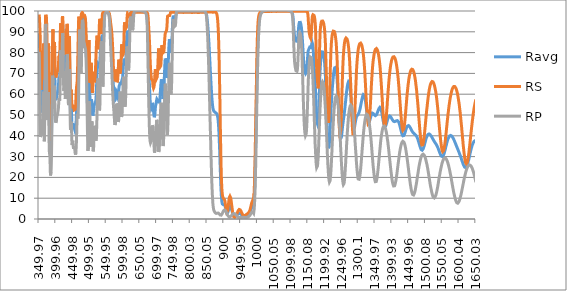
| Category | Ravg | RS | RP |
|---|---|---|---|
| 349.97 | 89.314 | 98.315 | 80.313 |
| 350.48 | 88.266 | 97.754 | 78.778 |
| 350.99 | 86.706 | 96.834 | 76.578 |
| 351.5 | 83.385 | 94.822 | 71.948 |
| 352.01 | 78.381 | 93.184 | 63.578 |
| 352.52 | 72.167 | 91.414 | 52.921 |
| 353.02 | 67.136 | 89.264 | 45.009 |
| 353.53 | 63.047 | 85.7 | 40.395 |
| 354.03 | 59.229 | 79.021 | 39.438 |
| 354.53 | 55.199 | 71.357 | 39.041 |
| 355.03 | 52.325 | 65.223 | 39.428 |
| 355.53 | 51.27 | 62.111 | 40.428 |
| 356.03 | 51.622 | 62.345 | 40.899 |
| 356.52 | 52.393 | 63.648 | 41.139 |
| 357.01 | 52.823 | 65.028 | 40.619 |
| 357.51 | 53.643 | 66.479 | 40.808 |
| 358.0 | 54.487 | 66.963 | 42.01 |
| 358.49 | 54.809 | 66.506 | 43.111 |
| 358.97 | 55.032 | 66.554 | 43.51 |
| 359.46 | 55.411 | 67.169 | 43.652 |
| 360.06 | 56.532 | 67.495 | 45.568 |
| 360.55 | 58.156 | 68.597 | 47.714 |
| 361.03 | 60.345 | 71.224 | 49.466 |
| 361.5 | 62.787 | 73.882 | 51.692 |
| 361.98 | 65.631 | 76.795 | 54.467 |
| 362.46 | 68.462 | 78.992 | 57.932 |
| 363.05 | 71.4 | 81.593 | 61.208 |
| 363.52 | 72.122 | 84.338 | 59.906 |
| 363.98 | 70.126 | 84.331 | 55.92 |
| 364.45 | 65.48 | 82.031 | 48.929 |
| 365.03 | 58.655 | 75.91 | 41.4 |
| 365.49 | 54.22 | 71.079 | 37.361 |
| 365.95 | 52.893 | 67.464 | 38.322 |
| 366.53 | 56.178 | 67.527 | 44.829 |
| 366.98 | 61.966 | 70.744 | 53.188 |
| 367.55 | 71.764 | 78.322 | 65.206 |
| 368.0 | 80.056 | 84.503 | 75.609 |
| 368.45 | 87.608 | 91.346 | 83.87 |
| 369.01 | 93.39 | 96.186 | 90.594 |
| 369.46 | 95.363 | 97.665 | 93.06 |
| 370.01 | 95.983 | 98.174 | 93.791 |
| 370.45 | 95.386 | 98.452 | 92.32 |
| 371.0 | 92.914 | 97.579 | 88.249 |
| 371.55 | 90.086 | 97.618 | 82.554 |
| 371.98 | 86.357 | 96.905 | 75.809 |
| 372.52 | 80.644 | 94.08 | 67.208 |
| 372.95 | 75.912 | 91.599 | 60.226 |
| 373.49 | 69.251 | 85.722 | 52.779 |
| 374.02 | 64.599 | 80.776 | 48.421 |
| 374.45 | 61.809 | 76.016 | 47.601 |
| 374.98 | 60.613 | 71.563 | 49.663 |
| 375.51 | 60.574 | 68.768 | 52.379 |
| 376.03 | 62.253 | 69.52 | 54.986 |
| 376.45 | 64.669 | 71.954 | 57.384 |
| 376.97 | 67.995 | 76.303 | 59.686 |
| 377.49 | 70.843 | 80.647 | 61.039 |
| 378.01 | 71.708 | 84.347 | 59.069 |
| 378.52 | 69.463 | 84.784 | 54.142 |
| 379.04 | 64.197 | 81.47 | 46.924 |
| 379.55 | 57.413 | 74.988 | 39.839 |
| 379.96 | 52.544 | 69.575 | 35.514 |
| 380.47 | 48.177 | 63.856 | 32.498 |
| 380.97 | 45.99 | 60.562 | 31.418 |
| 381.48 | 45.778 | 59.908 | 31.648 |
| 381.98 | 45.634 | 60.539 | 30.73 |
| 382.49 | 43.755 | 58.847 | 28.662 |
| 382.99 | 39.909 | 54.189 | 25.63 |
| 383.49 | 35.344 | 48.081 | 22.607 |
| 383.99 | 31.757 | 42.596 | 20.918 |
| 384.49 | 29.785 | 39.051 | 20.519 |
| 384.99 | 29.42 | 37.467 | 21.373 |
| 385.49 | 30.683 | 38.769 | 22.597 |
| 385.99 | 32.845 | 41.473 | 24.217 |
| 386.49 | 36.17 | 45.165 | 27.176 |
| 386.99 | 40.264 | 49.234 | 31.295 |
| 387.49 | 45.447 | 54.165 | 36.728 |
| 387.99 | 51.605 | 59.669 | 43.542 |
| 388.48 | 58.417 | 66.312 | 50.523 |
| 388.98 | 64.849 | 72.699 | 56.999 |
| 389.48 | 70.915 | 79.124 | 62.706 |
| 389.98 | 75.418 | 84.211 | 66.626 |
| 390.49 | 78.774 | 88.638 | 68.909 |
| 390.99 | 79.897 | 91.177 | 68.617 |
| 391.49 | 78.362 | 91.309 | 65.414 |
| 392.0 | 75.107 | 89.286 | 60.929 |
| 392.5 | 71.045 | 85.794 | 56.296 |
| 393.01 | 67.892 | 82.343 | 53.441 |
| 393.51 | 66.609 | 80.313 | 52.905 |
| 394.02 | 67.277 | 79.649 | 54.905 |
| 394.54 | 69.641 | 80.713 | 58.57 |
| 395.05 | 72.854 | 83.354 | 62.355 |
| 395.46 | 74.505 | 84.965 | 64.046 |
| 395.97 | 74.325 | 85.191 | 63.46 |
| 396.49 | 71.353 | 82.622 | 60.084 |
| 397.01 | 66.867 | 78.131 | 55.603 |
| 397.53 | 62.957 | 73.967 | 51.947 |
| 397.95 | 60.654 | 71.781 | 49.527 |
| 398.48 | 58.783 | 69.771 | 47.795 |
| 399.01 | 57.829 | 68.826 | 46.832 |
| 399.54 | 57.201 | 68.089 | 46.313 |
| 399.96 | 56.964 | 67.761 | 46.168 |
| 400.5 | 56.823 | 67.734 | 45.913 |
| 401.04 | 57.465 | 68.401 | 46.529 |
| 401.47 | 58.164 | 69.099 | 47.228 |
| 402.01 | 58.998 | 69.914 | 48.082 |
| 402.45 | 59.69 | 70.411 | 48.968 |
| 402.99 | 60.126 | 70.784 | 49.468 |
| 403.54 | 60.324 | 70.815 | 49.833 |
| 403.99 | 60.23 | 70.677 | 49.782 |
| 404.54 | 60.313 | 70.665 | 49.961 |
| 404.99 | 60.516 | 70.799 | 50.234 |
| 405.55 | 60.946 | 71.106 | 50.787 |
| 406.0 | 61.436 | 71.443 | 51.429 |
| 406.45 | 61.938 | 71.939 | 51.936 |
| 407.02 | 62.773 | 72.958 | 52.589 |
| 407.48 | 63.657 | 73.99 | 53.325 |
| 408.05 | 65.048 | 75.543 | 54.554 |
| 408.51 | 66.341 | 76.866 | 55.816 |
| 408.97 | 67.436 | 77.906 | 56.966 |
| 409.55 | 68.266 | 78.468 | 58.065 |
| 410.02 | 68.038 | 78.082 | 57.994 |
| 410.49 | 67.517 | 77.657 | 57.378 |
| 410.96 | 67.379 | 77.935 | 56.823 |
| 411.55 | 68.536 | 79.511 | 57.562 |
| 412.03 | 70.612 | 81.463 | 59.76 |
| 412.5 | 73.819 | 84.55 | 63.088 |
| 412.98 | 77.757 | 88.082 | 67.431 |
| 413.46 | 82.104 | 91.793 | 72.416 |
| 413.94 | 85.724 | 94.071 | 77.377 |
| 414.55 | 87.542 | 93.941 | 81.142 |
| 415.04 | 86.192 | 91.597 | 80.787 |
| 415.52 | 83.047 | 88.68 | 77.415 |
| 416.01 | 80.033 | 87.172 | 72.894 |
| 416.5 | 77.834 | 86.419 | 69.249 |
| 417.0 | 77.142 | 86.217 | 68.067 |
| 417.49 | 78.219 | 87.503 | 68.934 |
| 417.99 | 80.674 | 89.987 | 71.36 |
| 418.48 | 84.571 | 93.185 | 75.957 |
| 418.98 | 88.803 | 96.053 | 81.553 |
| 419.48 | 92.063 | 97.466 | 86.659 |
| 419.98 | 93.516 | 97.58 | 89.453 |
| 420.49 | 93.167 | 96.797 | 89.537 |
| 420.99 | 90.765 | 94.604 | 86.927 |
| 421.5 | 86.363 | 91.136 | 81.589 |
| 422.0 | 81.108 | 87.275 | 74.942 |
| 422.51 | 76.664 | 84.701 | 68.626 |
| 423.02 | 73.896 | 83.34 | 64.451 |
| 423.53 | 72.433 | 82.768 | 62.098 |
| 424.04 | 72.344 | 83.143 | 61.546 |
| 424.55 | 74.072 | 85.16 | 62.984 |
| 425.06 | 76.251 | 87.093 | 65.408 |
| 425.45 | 77.284 | 87.702 | 66.865 |
| 425.96 | 76.814 | 86.561 | 67.068 |
| 426.48 | 74.462 | 83.808 | 65.116 |
| 426.99 | 71.808 | 81.49 | 62.126 |
| 427.51 | 69.561 | 79.628 | 59.494 |
| 428.03 | 68.308 | 78.903 | 57.712 |
| 428.54 | 68.425 | 79.278 | 57.571 |
| 429.06 | 69.982 | 81.183 | 58.782 |
| 429.45 | 71.84 | 83.172 | 60.508 |
| 429.97 | 74.519 | 85.833 | 63.205 |
| 430.49 | 76.95 | 88.024 | 65.876 |
| 431.01 | 78.777 | 89.28 | 68.274 |
| 431.52 | 80.42 | 90.499 | 70.34 |
| 432.04 | 82.035 | 91.587 | 72.483 |
| 432.56 | 83.617 | 92.573 | 74.661 |
| 432.95 | 84.794 | 93.279 | 76.308 |
| 433.47 | 86.073 | 93.816 | 78.329 |
| 433.99 | 86.504 | 93.696 | 79.312 |
| 434.51 | 85.438 | 92.168 | 78.709 |
| 435.03 | 82.062 | 88.405 | 75.719 |
| 435.55 | 76.715 | 83.113 | 70.316 |
| 435.94 | 72.423 | 79.254 | 65.592 |
| 436.46 | 67.662 | 75.401 | 59.924 |
| 436.97 | 64.699 | 73.307 | 56.091 |
| 437.49 | 63.768 | 72.793 | 54.744 |
| 438.01 | 65.083 | 74.325 | 55.841 |
| 438.52 | 68.847 | 78.27 | 59.425 |
| 439.04 | 74.015 | 83.23 | 64.8 |
| 439.55 | 78.374 | 86.993 | 69.755 |
| 439.94 | 79.997 | 87.907 | 72.087 |
| 440.45 | 79.335 | 86.452 | 72.218 |
| 440.96 | 75.539 | 82.429 | 68.649 |
| 441.48 | 69.63 | 76.662 | 62.599 |
| 441.99 | 63.024 | 70.383 | 55.664 |
| 442.5 | 57.397 | 65.135 | 49.659 |
| 443.0 | 53.237 | 61.345 | 45.129 |
| 443.51 | 50.91 | 59.048 | 42.772 |
| 444.02 | 50.659 | 58.738 | 42.58 |
| 444.52 | 51.962 | 59.951 | 43.973 |
| 445.03 | 53.72 | 61.6 | 45.84 |
| 445.53 | 54.458 | 62.16 | 46.756 |
| 446.03 | 53.497 | 61.152 | 45.842 |
| 446.53 | 51.19 | 58.988 | 43.391 |
| 447.03 | 48.474 | 56.476 | 40.471 |
| 447.52 | 46.101 | 54.46 | 37.743 |
| 448.02 | 44.7 | 53.274 | 36.126 |
| 448.51 | 44.218 | 52.898 | 35.538 |
| 449.0 | 44.529 | 53.15 | 35.908 |
| 449.49 | 45.351 | 53.821 | 36.88 |
| 449.98 | 46.004 | 54.4 | 37.608 |
| 450.47 | 46.171 | 54.636 | 37.707 |
| 450.96 | 45.818 | 54.598 | 37.038 |
| 451.56 | 44.966 | 54.299 | 35.633 |
| 452.04 | 44.191 | 53.933 | 34.449 |
| 452.52 | 43.677 | 53.618 | 33.736 |
| 453.0 | 43.448 | 53.389 | 33.507 |
| 453.48 | 43.422 | 53.079 | 33.766 |
| 453.95 | 43.602 | 52.787 | 34.416 |
| 454.54 | 43.7 | 52.41 | 34.991 |
| 455.01 | 43.676 | 52.166 | 35.185 |
| 455.48 | 43.466 | 52.05 | 34.883 |
| 456.06 | 43.023 | 52.116 | 33.93 |
| 456.52 | 42.634 | 52.284 | 32.985 |
| 456.99 | 42.338 | 52.563 | 32.113 |
| 457.45 | 42.093 | 52.709 | 31.478 |
| 458.02 | 42.174 | 53.348 | 31 |
| 458.47 | 42.583 | 54.194 | 30.972 |
| 459.04 | 43.44 | 55.674 | 31.205 |
| 459.49 | 44.549 | 57.292 | 31.806 |
| 460.05 | 46.194 | 59.291 | 33.097 |
| 460.5 | 47.785 | 60.975 | 34.596 |
| 460.95 | 49.4 | 62.264 | 36.536 |
| 461.5 | 51.493 | 63.533 | 39.453 |
| 462.05 | 53.352 | 64.125 | 42.578 |
| 462.49 | 54.745 | 64.32 | 45.17 |
| 463.04 | 56.654 | 65.296 | 48.011 |
| 463.47 | 58.189 | 66.705 | 49.673 |
| 464.01 | 59.951 | 69.364 | 50.537 |
| 464.55 | 61.109 | 72.171 | 50.046 |
| 464.98 | 61.987 | 74.943 | 49.032 |
| 465.51 | 63.626 | 78.925 | 48.326 |
| 466.04 | 66.303 | 83.749 | 48.857 |
| 466.47 | 69.065 | 87.538 | 50.591 |
| 466.99 | 73.095 | 91.985 | 54.204 |
| 467.52 | 77.118 | 94.966 | 59.269 |
| 468.04 | 81.097 | 96.634 | 65.56 |
| 468.46 | 84.304 | 97.279 | 71.329 |
| 468.97 | 87.964 | 97.668 | 78.261 |
| 469.49 | 90.813 | 97.618 | 84.009 |
| 470.0 | 92.351 | 96.854 | 87.849 |
| 470.52 | 92.586 | 95.071 | 90.102 |
| 471.03 | 91.861 | 92.681 | 91.041 |
| 471.54 | 91.006 | 91.177 | 90.835 |
| 472.04 | 89.628 | 90.237 | 89.019 |
| 472.55 | 87.671 | 89.845 | 85.497 |
| 473.05 | 85.073 | 89.625 | 80.52 |
| 473.46 | 83.144 | 89.933 | 76.356 |
| 473.96 | 81.821 | 91.204 | 72.437 |
| 474.46 | 82.066 | 93.719 | 70.412 |
| 474.96 | 83.012 | 96.107 | 69.916 |
| 475.46 | 84.521 | 98.057 | 70.985 |
| 475.96 | 86.372 | 98.756 | 73.988 |
| 476.46 | 89.05 | 99.025 | 79.075 |
| 477.05 | 92.478 | 99.095 | 85.861 |
| 477.55 | 94.893 | 99.164 | 90.621 |
| 478.05 | 96.432 | 99.236 | 93.629 |
| 478.54 | 97.155 | 99.239 | 95.072 |
| 479.04 | 97.422 | 99.129 | 95.716 |
| 479.54 | 97.453 | 99.101 | 95.804 |
| 480.03 | 97.395 | 99.074 | 95.717 |
| 480.53 | 96.978 | 98.856 | 95.1 |
| 481.03 | 96.394 | 98.56 | 94.228 |
| 481.53 | 95.51 | 98.295 | 92.725 |
| 482.03 | 94.432 | 97.979 | 90.884 |
| 482.52 | 93.196 | 97.647 | 88.746 |
| 483.03 | 91.956 | 97.353 | 86.558 |
| 483.53 | 90.886 | 97.24 | 84.532 |
| 484.03 | 90.074 | 97.139 | 83.009 |
| 484.53 | 89.643 | 97.205 | 82.081 |
| 485.04 | 89.418 | 97.217 | 81.618 |
| 485.55 | 89.635 | 97.531 | 81.738 |
| 486.05 | 89.934 | 97.627 | 82.24 |
| 486.46 | 90.196 | 97.602 | 82.79 |
| 486.97 | 90.315 | 97.425 | 83.206 |
| 487.49 | 90.089 | 96.932 | 83.246 |
| 488.0 | 89.358 | 96.038 | 82.677 |
| 488.52 | 88.111 | 94.811 | 81.41 |
| 489.04 | 86.259 | 92.856 | 79.661 |
| 489.45 | 84.595 | 91.242 | 77.948 |
| 489.97 | 82.098 | 88.744 | 75.453 |
| 490.5 | 79.323 | 86.122 | 72.523 |
| 491.03 | 76.306 | 83.356 | 69.256 |
| 491.45 | 73.658 | 80.898 | 66.419 |
| 491.98 | 69.838 | 77.322 | 62.353 |
| 492.52 | 65.294 | 73.015 | 57.574 |
| 493.05 | 60.648 | 69.191 | 52.105 |
| 493.49 | 57.282 | 67.105 | 47.458 |
| 494.03 | 53.81 | 65.893 | 41.728 |
| 494.46 | 51.842 | 65.884 | 37.799 |
| 495.01 | 50.372 | 66.52 | 34.223 |
| 495.45 | 50.342 | 67.96 | 32.723 |
| 496.0 | 51.843 | 70.881 | 32.804 |
| 496.56 | 55.058 | 75.206 | 34.91 |
| 497.0 | 58.42 | 79.037 | 37.804 |
| 497.45 | 62.151 | 82.674 | 41.629 |
| 498.01 | 66.356 | 85.469 | 47.242 |
| 498.46 | 68.633 | 86.009 | 51.256 |
| 499.03 | 69.734 | 84.424 | 55.043 |
| 499.49 | 68.995 | 81.411 | 56.579 |
| 499.95 | 67.066 | 77.53 | 56.602 |
| 500.52 | 62.828 | 71.789 | 53.867 |
| 500.98 | 59.934 | 68.906 | 50.963 |
| 501.45 | 57.119 | 66.948 | 47.289 |
| 502.03 | 53.919 | 65.405 | 42.432 |
| 502.5 | 52.045 | 65.093 | 38.998 |
| 502.97 | 51.173 | 65.831 | 36.516 |
| 503.56 | 51.484 | 68.286 | 34.682 |
| 504.03 | 52.887 | 71.095 | 34.679 |
| 504.51 | 54.765 | 73.677 | 35.853 |
| 504.99 | 56.489 | 75.064 | 37.915 |
| 505.47 | 57.612 | 74.606 | 40.618 |
| 505.95 | 57.905 | 72.475 | 43.336 |
| 506.55 | 57.239 | 68.518 | 45.96 |
| 507.04 | 56.269 | 65.584 | 46.954 |
| 507.53 | 55.026 | 63.206 | 46.845 |
| 508.02 | 53.533 | 61.532 | 45.534 |
| 508.51 | 52.068 | 60.691 | 43.445 |
| 509.0 | 50.665 | 60.56 | 40.77 |
| 509.49 | 49.719 | 61.402 | 38.035 |
| 509.99 | 49.406 | 63.282 | 35.529 |
| 510.48 | 49.642 | 65.633 | 33.651 |
| 510.98 | 50.306 | 68.088 | 32.523 |
| 511.48 | 51.192 | 69.968 | 32.417 |
| 511.98 | 52.003 | 70.751 | 33.255 |
| 512.48 | 52.726 | 70.517 | 34.935 |
| 512.99 | 53.339 | 69.551 | 37.127 |
| 513.49 | 53.972 | 68.409 | 39.534 |
| 514.0 | 54.549 | 67.321 | 41.776 |
| 514.5 | 55.023 | 66.421 | 43.625 |
| 515.01 | 55.287 | 65.77 | 44.804 |
| 515.52 | 55.511 | 65.754 | 45.268 |
| 516.03 | 55.63 | 66.272 | 44.987 |
| 516.54 | 55.687 | 67.265 | 44.108 |
| 517.05 | 55.858 | 68.905 | 42.811 |
| 517.56 | 56.014 | 70.833 | 41.195 |
| 517.95 | 56.243 | 72.513 | 39.972 |
| 518.46 | 56.67 | 74.781 | 38.559 |
| 518.97 | 57.286 | 76.948 | 37.624 |
| 519.49 | 58.284 | 79.145 | 37.423 |
| 520.0 | 59.638 | 81.247 | 38.029 |
| 520.52 | 61.354 | 83.165 | 39.542 |
| 521.04 | 63.454 | 85.024 | 41.885 |
| 521.55 | 65.714 | 86.526 | 44.902 |
| 521.94 | 67.443 | 87.395 | 47.49 |
| 522.46 | 69.694 | 88.141 | 51.247 |
| 522.98 | 71.623 | 88.125 | 55.122 |
| 523.49 | 73.015 | 87.226 | 58.803 |
| 524.01 | 73.852 | 85.643 | 62.061 |
| 524.53 | 74.235 | 83.841 | 64.629 |
| 525.05 | 74.487 | 82.459 | 66.514 |
| 525.56 | 74.586 | 81.606 | 67.566 |
| 525.95 | 74.559 | 81.502 | 67.616 |
| 526.47 | 74.176 | 81.484 | 66.868 |
| 526.98 | 73.599 | 82.019 | 65.179 |
| 527.5 | 72.955 | 83.356 | 62.554 |
| 528.02 | 72.43 | 85.405 | 59.454 |
| 528.53 | 72.263 | 88.304 | 56.222 |
| 529.05 | 72.524 | 91.375 | 53.672 |
| 529.56 | 73.055 | 93.882 | 52.229 |
| 529.95 | 73.538 | 95.14 | 51.937 |
| 530.46 | 74.493 | 96.238 | 52.747 |
| 530.98 | 75.776 | 96.635 | 54.917 |
| 531.49 | 77.428 | 96.491 | 58.365 |
| 532.0 | 79.177 | 95.478 | 62.876 |
| 532.51 | 80.695 | 93.45 | 67.941 |
| 533.02 | 82.101 | 91.314 | 72.887 |
| 533.53 | 83.659 | 90.014 | 77.304 |
| 534.04 | 85.105 | 89.456 | 80.755 |
| 534.54 | 86.186 | 89.101 | 83.271 |
| 535.05 | 86.872 | 88.958 | 84.785 |
| 535.55 | 87.262 | 89.015 | 85.509 |
| 536.05 | 87.318 | 89.251 | 85.386 |
| 536.56 | 87.389 | 90.407 | 84.371 |
| 537.06 | 87.333 | 92.451 | 82.215 |
| 537.56 | 86.931 | 95.166 | 78.697 |
| 538.05 | 85.763 | 97.458 | 74.068 |
| 538.55 | 83.933 | 98.572 | 69.294 |
| 539.04 | 82.326 | 98.968 | 65.684 |
| 539.54 | 81.392 | 99.106 | 63.678 |
| 540.03 | 81.391 | 99.271 | 63.51 |
| 540.52 | 81.803 | 99.283 | 64.322 |
| 541.01 | 82.98 | 99.357 | 66.603 |
| 541.49 | 84.765 | 99.426 | 70.103 |
| 541.98 | 87.087 | 99.381 | 74.793 |
| 542.46 | 89.949 | 99.454 | 80.445 |
| 543.06 | 93.351 | 99.384 | 87.318 |
| 543.54 | 95.543 | 99.464 | 91.622 |
| 544.02 | 96.868 | 99.389 | 94.346 |
| 544.5 | 97.818 | 99.516 | 96.12 |
| 544.97 | 98.328 | 99.466 | 97.19 |
| 545.56 | 98.711 | 99.452 | 97.971 |
| 546.03 | 98.933 | 99.437 | 98.428 |
| 546.5 | 99.115 | 99.524 | 98.706 |
| 546.97 | 99.183 | 99.447 | 98.918 |
| 547.55 | 99.267 | 99.431 | 99.103 |
| 548.01 | 99.329 | 99.447 | 99.21 |
| 548.47 | 99.363 | 99.422 | 99.304 |
| 549.04 | 99.408 | 99.448 | 99.368 |
| 549.5 | 99.446 | 99.469 | 99.423 |
| 549.95 | 99.433 | 99.406 | 99.459 |
| 550.51 | 99.482 | 99.478 | 99.487 |
| 550.96 | 99.494 | 99.463 | 99.525 |
| 551.52 | 99.481 | 99.423 | 99.539 |
| 551.97 | 99.458 | 99.441 | 99.475 |
| 552.52 | 99.456 | 99.421 | 99.491 |
| 552.96 | 99.43 | 99.412 | 99.449 |
| 553.51 | 99.388 | 99.363 | 99.412 |
| 553.95 | 99.399 | 99.409 | 99.388 |
| 554.49 | 99.373 | 99.394 | 99.352 |
| 555.03 | 99.295 | 99.347 | 99.243 |
| 555.46 | 99.275 | 99.361 | 99.189 |
| 556.0 | 99.21 | 99.368 | 99.053 |
| 556.53 | 99.119 | 99.374 | 98.865 |
| 556.96 | 98.977 | 99.288 | 98.667 |
| 557.48 | 98.842 | 99.283 | 98.401 |
| 558.01 | 98.513 | 99.123 | 97.903 |
| 558.53 | 98.161 | 98.999 | 97.322 |
| 558.95 | 97.76 | 98.827 | 96.694 |
| 559.47 | 97.096 | 98.499 | 95.693 |
| 559.99 | 96.269 | 98.034 | 94.503 |
| 560.5 | 95.224 | 97.505 | 92.942 |
| 561.02 | 94.014 | 96.88 | 91.147 |
| 561.53 | 92.749 | 96.294 | 89.204 |
| 562.04 | 91.394 | 95.614 | 87.175 |
| 562.55 | 89.961 | 94.912 | 85.009 |
| 563.05 | 88.579 | 94.253 | 82.905 |
| 563.46 | 87.534 | 93.713 | 81.355 |
| 563.96 | 86.287 | 93.09 | 79.484 |
| 564.46 | 85.022 | 92.376 | 77.667 |
| 564.96 | 83.906 | 91.792 | 76.019 |
| 565.46 | 82.731 | 91.051 | 74.412 |
| 565.96 | 81.531 | 90.306 | 72.755 |
| 566.46 | 80.239 | 89.376 | 71.101 |
| 567.05 | 78.522 | 88.133 | 68.911 |
| 567.55 | 76.903 | 86.911 | 66.894 |
| 568.04 | 75.211 | 85.481 | 64.94 |
| 568.54 | 73.47 | 83.999 | 62.94 |
| 569.03 | 71.632 | 82.277 | 60.987 |
| 569.53 | 69.857 | 80.417 | 59.298 |
| 570.02 | 68.068 | 78.457 | 57.68 |
| 570.51 | 66.254 | 76.158 | 56.35 |
| 571.01 | 64.547 | 73.939 | 55.155 |
| 571.5 | 62.871 | 71.616 | 54.127 |
| 572.0 | 61.32 | 69.489 | 53.151 |
| 572.49 | 59.953 | 67.8 | 52.107 |
| 572.99 | 58.852 | 66.734 | 50.97 |
| 573.48 | 58.001 | 66.243 | 49.76 |
| 573.98 | 57.319 | 66.139 | 48.499 |
| 574.48 | 56.801 | 66.399 | 47.203 |
| 574.98 | 56.472 | 66.92 | 46.024 |
| 575.48 | 56.385 | 67.527 | 45.243 |
| 575.98 | 56.499 | 68.214 | 44.785 |
| 576.48 | 56.849 | 68.889 | 44.809 |
| 576.99 | 57.394 | 69.546 | 45.243 |
| 577.49 | 58.249 | 70.406 | 46.092 |
| 578.0 | 59.308 | 71.343 | 47.273 |
| 578.51 | 60.269 | 71.915 | 48.623 |
| 579.02 | 61.091 | 71.915 | 50.267 |
| 579.53 | 61.573 | 71.272 | 51.874 |
| 580.05 | 61.737 | 70.048 | 53.425 |
| 580.46 | 61.703 | 68.887 | 54.519 |
| 580.98 | 61.467 | 67.388 | 55.546 |
| 581.5 | 61.181 | 66.338 | 56.023 |
| 582.03 | 60.78 | 65.729 | 55.831 |
| 582.55 | 60.267 | 65.58 | 54.953 |
| 582.97 | 59.794 | 65.795 | 53.794 |
| 583.5 | 59.225 | 66.359 | 52.092 |
| 584.04 | 58.772 | 67.365 | 50.178 |
| 584.46 | 58.618 | 68.48 | 48.756 |
| 585.0 | 58.65 | 69.919 | 47.38 |
| 585.54 | 59.188 | 71.699 | 46.676 |
| 585.98 | 59.828 | 73.119 | 46.537 |
| 586.52 | 60.895 | 74.878 | 46.912 |
| 586.96 | 61.807 | 75.96 | 47.653 |
| 587.51 | 62.869 | 76.62 | 49.118 |
| 587.95 | 63.533 | 76.461 | 50.606 |
| 588.51 | 64.103 | 75.472 | 52.733 |
| 588.95 | 64.286 | 74.039 | 54.534 |
| 589.52 | 64.445 | 72.04 | 56.851 |
| 589.97 | 64.683 | 70.79 | 58.576 |
| 590.53 | 65.174 | 69.962 | 60.386 |
| 590.99 | 65.441 | 69.642 | 61.24 |
| 591.56 | 65.633 | 69.718 | 61.547 |
| 592.02 | 65.634 | 70.163 | 61.106 |
| 592.48 | 65.54 | 71.029 | 60.05 |
| 593.06 | 65.295 | 72.615 | 57.974 |
| 593.52 | 65.062 | 74.27 | 55.853 |
| 593.99 | 65.06 | 76.389 | 53.732 |
| 594.46 | 65.219 | 78.668 | 51.77 |
| 595.05 | 65.711 | 81.487 | 49.934 |
| 595.52 | 66.095 | 83.111 | 49.078 |
| 596.0 | 66.423 | 83.976 | 48.87 |
| 596.47 | 66.414 | 83.564 | 49.265 |
| 596.95 | 66.283 | 82.31 | 50.255 |
| 597.55 | 66.297 | 80.348 | 52.246 |
| 598.04 | 66.809 | 79.247 | 54.37 |
| 598.52 | 67.742 | 78.661 | 56.822 |
| 599.01 | 68.963 | 78.48 | 59.446 |
| 599.49 | 70.279 | 78.449 | 62.109 |
| 599.98 | 71.651 | 78.719 | 64.583 |
| 600.47 | 72.845 | 79.229 | 66.46 |
| 600.96 | 73.915 | 80.05 | 67.781 |
| 601.46 | 74.879 | 81.378 | 68.379 |
| 601.95 | 75.753 | 83.412 | 68.094 |
| 602.45 | 76.543 | 86.099 | 66.988 |
| 602.95 | 77.099 | 89.106 | 65.091 |
| 603.45 | 77.17 | 91.772 | 62.569 |
| 603.95 | 76.794 | 93.789 | 59.8 |
| 604.45 | 75.94 | 94.572 | 57.308 |
| 604.95 | 74.939 | 94.572 | 55.305 |
| 605.45 | 73.725 | 93.46 | 53.991 |
| 605.96 | 73.295 | 92.674 | 53.916 |
| 606.46 | 73.306 | 92.168 | 54.445 |
| 606.97 | 73.875 | 91.885 | 55.865 |
| 607.48 | 74.816 | 91.769 | 57.862 |
| 607.99 | 76.108 | 91.561 | 60.656 |
| 608.5 | 77.782 | 91.522 | 64.042 |
| 609.01 | 79.782 | 91.64 | 67.924 |
| 609.52 | 81.814 | 91.814 | 71.814 |
| 610.03 | 83.803 | 92.145 | 75.46 |
| 610.54 | 85.744 | 92.946 | 78.543 |
| 611.06 | 87.523 | 94.171 | 80.876 |
| 611.44 | 88.762 | 95.485 | 82.04 |
| 611.95 | 90.01 | 97.111 | 82.909 |
| 612.47 | 90.574 | 98.193 | 82.954 |
| 612.98 | 90.44 | 98.728 | 82.151 |
| 613.5 | 89.726 | 98.912 | 80.54 |
| 614.01 | 88.551 | 98.984 | 78.118 |
| 614.53 | 87.164 | 98.778 | 75.551 |
| 615.04 | 85.879 | 98.353 | 73.405 |
| 615.56 | 84.923 | 97.868 | 71.978 |
| 615.95 | 84.5 | 97.53 | 71.471 |
| 616.46 | 84.429 | 97.407 | 71.452 |
| 616.98 | 84.652 | 97.301 | 72.003 |
| 617.49 | 85.222 | 97.191 | 73.254 |
| 618.01 | 86.249 | 97.193 | 75.304 |
| 618.52 | 87.524 | 97.063 | 77.984 |
| 619.03 | 89.224 | 97.049 | 81.399 |
| 619.55 | 91.147 | 97.023 | 85.272 |
| 620.06 | 93.039 | 97.118 | 88.96 |
| 620.45 | 94.272 | 97.232 | 91.313 |
| 620.96 | 95.694 | 97.749 | 93.639 |
| 621.47 | 96.762 | 98.381 | 95.144 |
| 621.98 | 97.555 | 98.975 | 96.134 |
| 622.49 | 98.034 | 99.316 | 96.751 |
| 623.0 | 98.205 | 99.291 | 97.119 |
| 623.51 | 98.371 | 99.437 | 97.305 |
| 624.01 | 98.288 | 99.302 | 97.273 |
| 624.52 | 98.182 | 99.4 | 96.964 |
| 625.03 | 97.815 | 99.393 | 96.236 |
| 625.53 | 97.241 | 99.406 | 95.076 |
| 626.03 | 96.491 | 99.413 | 93.57 |
| 626.54 | 95.81 | 99.389 | 92.231 |
| 627.04 | 95.372 | 99.394 | 91.349 |
| 627.54 | 95.215 | 99.476 | 90.953 |
| 628.04 | 95.076 | 99.4 | 90.752 |
| 628.53 | 95.198 | 99.501 | 90.894 |
| 629.03 | 95.319 | 99.451 | 91.187 |
| 629.52 | 95.549 | 99.376 | 91.722 |
| 630.02 | 96.055 | 99.473 | 92.638 |
| 630.51 | 96.769 | 99.398 | 94.14 |
| 631.0 | 97.699 | 99.519 | 95.879 |
| 631.48 | 98.463 | 99.477 | 97.45 |
| 631.97 | 99.031 | 99.427 | 98.635 |
| 632.46 | 99.299 | 99.39 | 99.208 |
| 633.06 | 99.509 | 99.437 | 99.581 |
| 633.54 | 99.583 | 99.459 | 99.706 |
| 634.02 | 99.634 | 99.45 | 99.818 |
| 634.5 | 99.649 | 99.405 | 99.893 |
| 634.97 | 99.678 | 99.466 | 99.891 |
| 635.45 | 99.742 | 99.495 | 99.99 |
| 636.04 | 99.686 | 99.428 | 99.944 |
| 636.51 | 99.712 | 99.439 | 99.985 |
| 636.98 | 99.726 | 99.459 | 99.993 |
| 637.56 | 99.735 | 99.43 | 100.04 |
| 638.02 | 99.698 | 99.387 | 100.008 |
| 638.48 | 99.69 | 99.374 | 100.007 |
| 639.06 | 99.714 | 99.396 | 100.033 |
| 639.52 | 99.749 | 99.463 | 100.035 |
| 639.97 | 99.741 | 99.443 | 100.04 |
| 640.54 | 99.755 | 99.453 | 100.058 |
| 640.99 | 99.743 | 99.43 | 100.055 |
| 641.55 | 99.736 | 99.427 | 100.045 |
| 642.0 | 99.763 | 99.453 | 100.074 |
| 642.55 | 99.7 | 99.328 | 100.073 |
| 643.0 | 99.725 | 99.396 | 100.054 |
| 643.55 | 99.767 | 99.422 | 100.113 |
| 643.99 | 99.781 | 99.46 | 100.103 |
| 644.53 | 99.742 | 99.421 | 100.064 |
| 644.97 | 99.731 | 99.349 | 100.112 |
| 645.51 | 99.753 | 99.449 | 100.056 |
| 646.05 | 99.755 | 99.435 | 100.075 |
| 646.47 | 99.751 | 99.44 | 100.063 |
| 647.01 | 99.768 | 99.453 | 100.083 |
| 647.54 | 99.731 | 99.392 | 100.069 |
| 647.96 | 99.762 | 99.461 | 100.063 |
| 648.48 | 99.744 | 99.374 | 100.114 |
| 649.01 | 99.765 | 99.45 | 100.08 |
| 649.53 | 99.713 | 99.395 | 100.03 |
| 650.05 | 99.738 | 99.418 | 100.059 |
| 650.46 | 99.748 | 99.444 | 100.052 |
| 650.97 | 99.734 | 99.393 | 100.075 |
| 651.49 | 99.744 | 99.403 | 100.085 |
| 652.0 | 99.775 | 99.447 | 100.103 |
| 652.51 | 99.746 | 99.435 | 100.058 |
| 653.01 | 99.717 | 99.352 | 100.082 |
| 653.52 | 99.772 | 99.483 | 100.061 |
| 654.02 | 99.758 | 99.448 | 100.068 |
| 654.52 | 99.732 | 99.416 | 100.048 |
| 655.02 | 99.71 | 99.387 | 100.033 |
| 655.52 | 99.738 | 99.414 | 100.062 |
| 656.02 | 99.717 | 99.443 | 99.991 |
| 656.51 | 99.692 | 99.383 | 100.001 |
| 657.01 | 99.699 | 99.35 | 100.048 |
| 657.5 | 99.716 | 99.414 | 100.018 |
| 658.0 | 99.71 | 99.425 | 99.995 |
| 658.49 | 99.713 | 99.408 | 100.018 |
| 658.98 | 99.717 | 99.46 | 99.974 |
| 659.47 | 99.723 | 99.511 | 99.935 |
| 659.96 | 99.629 | 99.374 | 99.885 |
| 660.55 | 99.607 | 99.335 | 99.88 |
| 661.04 | 99.689 | 99.446 | 99.931 |
| 661.53 | 99.64 | 99.391 | 99.889 |
| 662.03 | 99.588 | 99.362 | 99.813 |
| 662.52 | 99.646 | 99.46 | 99.832 |
| 663.01 | 99.571 | 99.369 | 99.774 |
| 663.5 | 99.597 | 99.462 | 99.733 |
| 663.99 | 99.591 | 99.444 | 99.737 |
| 664.49 | 99.551 | 99.442 | 99.661 |
| 664.98 | 99.527 | 99.436 | 99.619 |
| 665.48 | 99.489 | 99.444 | 99.534 |
| 665.97 | 99.462 | 99.438 | 99.487 |
| 666.47 | 99.404 | 99.47 | 99.339 |
| 666.97 | 99.356 | 99.433 | 99.278 |
| 667.47 | 99.272 | 99.474 | 99.07 |
| 667.97 | 99.167 | 99.386 | 98.948 |
| 668.47 | 99.024 | 99.4 | 98.648 |
| 668.98 | 98.854 | 99.415 | 98.292 |
| 669.48 | 98.621 | 99.368 | 97.874 |
| 669.99 | 98.283 | 99.339 | 97.228 |
| 670.5 | 97.838 | 99.29 | 96.385 |
| 671.01 | 97.227 | 99.292 | 95.163 |
| 671.53 | 96.369 | 99.25 | 93.488 |
| 672.05 | 95.177 | 99.121 | 91.232 |
| 672.46 | 93.981 | 99.071 | 88.891 |
| 672.98 | 92.059 | 98.832 | 85.287 |
| 673.5 | 89.761 | 98.428 | 81.093 |
| 674.03 | 87.088 | 97.774 | 76.401 |
| 674.45 | 84.755 | 97.014 | 72.495 |
| 674.98 | 81.77 | 95.726 | 67.814 |
| 675.52 | 78.773 | 94.246 | 63.3 |
| 676.05 | 75.771 | 92.702 | 58.839 |
| 676.48 | 73.475 | 91.411 | 55.539 |
| 677.02 | 70.786 | 89.995 | 51.576 |
| 677.46 | 68.67 | 88.656 | 48.684 |
| 678.0 | 66.205 | 87.034 | 45.377 |
| 678.55 | 63.888 | 85.13 | 42.646 |
| 678.99 | 62.169 | 83.524 | 40.813 |
| 679.54 | 60.145 | 81.213 | 39.078 |
| 679.99 | 58.614 | 79.113 | 38.116 |
| 680.55 | 56.9 | 76.514 | 37.287 |
| 681.0 | 55.754 | 74.602 | 36.905 |
| 681.45 | 54.839 | 73.072 | 36.606 |
| 682.01 | 53.959 | 71.469 | 36.449 |
| 682.47 | 53.474 | 70.443 | 36.504 |
| 683.04 | 53.052 | 69.387 | 36.717 |
| 683.5 | 52.814 | 68.561 | 37.067 |
| 683.96 | 52.786 | 67.907 | 37.666 |
| 684.54 | 52.978 | 67.276 | 38.679 |
| 685.01 | 53.304 | 66.967 | 39.641 |
| 685.47 | 53.77 | 66.837 | 40.703 |
| 686.06 | 54.527 | 66.877 | 42.177 |
| 686.53 | 55.119 | 66.937 | 43.302 |
| 687.01 | 55.586 | 66.888 | 44.285 |
| 687.48 | 55.828 | 66.596 | 45.059 |
| 687.96 | 55.747 | 66.003 | 45.491 |
| 688.56 | 55.194 | 64.879 | 45.508 |
| 689.04 | 54.506 | 64.014 | 44.999 |
| 689.52 | 53.784 | 63.454 | 44.114 |
| 690.0 | 52.922 | 63.065 | 42.78 |
| 690.49 | 52.036 | 62.885 | 41.187 |
| 690.98 | 51.149 | 62.934 | 39.364 |
| 691.46 | 50.349 | 63.17 | 37.527 |
| 691.96 | 49.592 | 63.466 | 35.719 |
| 692.45 | 49.124 | 64.092 | 34.155 |
| 693.06 | 48.932 | 65.227 | 32.638 |
| 693.56 | 49.111 | 66.336 | 31.886 |
| 694.05 | 49.57 | 67.601 | 31.539 |
| 694.55 | 50.289 | 68.908 | 31.67 |
| 695.05 | 51.247 | 70.229 | 32.264 |
| 695.55 | 52.311 | 71.339 | 33.284 |
| 696.05 | 53.334 | 71.981 | 34.687 |
| 696.55 | 54.128 | 71.91 | 36.346 |
| 697.06 | 54.634 | 71.018 | 38.251 |
| 697.56 | 55.01 | 69.746 | 40.274 |
| 697.94 | 55.369 | 68.91 | 41.827 |
| 698.44 | 55.86 | 67.924 | 43.796 |
| 698.95 | 56.412 | 67.359 | 45.466 |
| 699.46 | 56.963 | 67.118 | 46.808 |
| 699.97 | 57.388 | 67.115 | 47.66 |
| 700.48 | 57.641 | 67.278 | 48.005 |
| 700.98 | 57.71 | 67.625 | 47.795 |
| 701.49 | 57.654 | 68.286 | 47.021 |
| 702.01 | 57.488 | 69.237 | 45.739 |
| 702.52 | 57.228 | 70.464 | 43.992 |
| 703.03 | 57.004 | 72.067 | 41.94 |
| 703.54 | 56.819 | 73.912 | 39.726 |
| 704.05 | 56.781 | 76.007 | 37.555 |
| 704.56 | 56.867 | 78.183 | 35.551 |
| 704.95 | 57.014 | 79.745 | 34.283 |
| 705.46 | 57.143 | 81.35 | 32.937 |
| 705.97 | 57.114 | 81.995 | 32.234 |
| 706.49 | 56.77 | 81.536 | 32.005 |
| 707.0 | 56.209 | 80.059 | 32.36 |
| 707.51 | 55.61 | 77.864 | 33.357 |
| 708.02 | 55.402 | 75.969 | 34.836 |
| 708.54 | 55.677 | 74.515 | 36.84 |
| 709.05 | 56.535 | 73.798 | 39.271 |
| 709.56 | 57.639 | 73.349 | 41.928 |
| 709.94 | 58.562 | 73.103 | 44.02 |
| 710.45 | 59.905 | 72.932 | 46.877 |
| 710.96 | 61.204 | 72.884 | 49.524 |
| 711.47 | 62.516 | 73.178 | 51.854 |
| 711.98 | 63.732 | 73.639 | 53.826 |
| 712.49 | 64.795 | 74.392 | 55.199 |
| 713.0 | 65.76 | 75.62 | 55.899 |
| 713.5 | 66.56 | 77.075 | 56.045 |
| 714.01 | 67.138 | 78.852 | 55.424 |
| 714.52 | 67.581 | 80.968 | 54.195 |
| 715.02 | 67.505 | 82.716 | 52.294 |
| 715.52 | 66.72 | 83.536 | 49.903 |
| 716.03 | 65.028 | 82.97 | 47.087 |
| 716.53 | 62.931 | 81.648 | 44.215 |
| 717.03 | 60.903 | 80.438 | 41.367 |
| 717.52 | 59.421 | 79.977 | 38.866 |
| 718.02 | 58.333 | 79.762 | 36.905 |
| 718.52 | 57.669 | 79.697 | 35.641 |
| 719.01 | 57.39 | 79.694 | 35.085 |
| 719.51 | 57.471 | 79.679 | 35.263 |
| 720.0 | 57.91 | 79.705 | 36.114 |
| 720.49 | 58.804 | 79.928 | 37.68 |
| 720.98 | 60.102 | 80.28 | 39.923 |
| 721.46 | 61.74 | 80.81 | 42.67 |
| 721.95 | 63.697 | 81.565 | 45.829 |
| 722.56 | 66.581 | 82.926 | 50.236 |
| 723.04 | 68.943 | 84.144 | 53.742 |
| 723.52 | 71.187 | 85.358 | 57.017 |
| 724.0 | 73.212 | 86.565 | 59.859 |
| 724.47 | 74.935 | 87.696 | 62.174 |
| 724.95 | 76.241 | 88.631 | 63.851 |
| 725.54 | 77.165 | 89.292 | 65.037 |
| 726.01 | 77.379 | 89.576 | 65.183 |
| 726.48 | 77.182 | 89.718 | 64.647 |
| 726.95 | 76.622 | 89.822 | 63.422 |
| 727.53 | 75.362 | 89.896 | 60.829 |
| 728.0 | 74.089 | 90.071 | 58.107 |
| 728.46 | 72.613 | 90.256 | 54.971 |
| 729.03 | 70.682 | 90.578 | 50.785 |
| 729.49 | 69.209 | 90.839 | 47.579 |
| 730.06 | 67.834 | 91.479 | 44.188 |
| 730.51 | 67.388 | 92.492 | 42.285 |
| 730.96 | 67.492 | 93.799 | 41.186 |
| 731.52 | 68.114 | 95.772 | 40.456 |
| 731.97 | 68.82 | 96.928 | 40.711 |
| 732.52 | 69.672 | 97.533 | 41.811 |
| 732.97 | 70.557 | 97.692 | 43.422 |
| 733.52 | 71.979 | 97.757 | 46.201 |
| 733.96 | 73.354 | 97.798 | 48.91 |
| 734.5 | 75.472 | 97.822 | 53.121 |
| 735.04 | 77.722 | 97.766 | 57.677 |
| 735.47 | 79.571 | 97.79 | 61.353 |
| 736.01 | 81.77 | 97.793 | 65.746 |
| 736.55 | 83.642 | 97.773 | 69.511 |
| 736.97 | 84.828 | 97.804 | 71.853 |
| 737.5 | 85.938 | 97.842 | 74.034 |
| 738.03 | 86.462 | 97.852 | 75.071 |
| 738.55 | 86.338 | 97.803 | 74.872 |
| 738.97 | 85.92 | 97.904 | 73.936 |
| 739.49 | 84.902 | 98.16 | 71.644 |
| 740.01 | 83.449 | 98.496 | 68.401 |
| 740.52 | 81.978 | 98.872 | 65.084 |
| 741.03 | 80.795 | 99.18 | 62.411 |
| 741.54 | 79.908 | 99.306 | 60.511 |
| 742.05 | 79.583 | 99.427 | 59.74 |
| 742.46 | 79.479 | 99.344 | 59.614 |
| 742.96 | 79.804 | 99.39 | 60.217 |
| 743.47 | 80.343 | 99.326 | 61.359 |
| 743.97 | 81.214 | 99.38 | 63.048 |
| 744.47 | 82.336 | 99.313 | 65.36 |
| 744.96 | 83.864 | 99.388 | 68.341 |
| 745.46 | 85.738 | 99.356 | 72.12 |
| 745.96 | 88.089 | 99.37 | 76.807 |
| 746.55 | 91.076 | 99.412 | 82.739 |
| 747.04 | 93.274 | 99.396 | 87.151 |
| 747.53 | 95.071 | 99.404 | 90.737 |
| 748.02 | 96.281 | 99.434 | 93.127 |
| 748.51 | 97.005 | 99.383 | 94.628 |
| 749.0 | 97.462 | 99.357 | 95.568 |
| 749.49 | 97.773 | 99.413 | 96.133 |
| 749.98 | 97.904 | 99.431 | 96.376 |
| 750.47 | 97.782 | 99.392 | 96.171 |
| 751.05 | 97.312 | 99.355 | 95.269 |
| 751.54 | 96.753 | 99.414 | 94.093 |
| 752.03 | 96.217 | 99.374 | 93.059 |
| 752.51 | 95.895 | 99.387 | 92.404 |
| 753.0 | 95.805 | 99.419 | 92.191 |
| 753.49 | 95.788 | 99.429 | 92.146 |
| 753.98 | 95.773 | 99.399 | 92.147 |
| 754.47 | 95.841 | 99.44 | 92.243 |
| 754.96 | 95.895 | 99.376 | 92.414 |
| 755.55 | 96.16 | 99.432 | 92.888 |
| 756.04 | 96.423 | 99.372 | 93.474 |
| 756.53 | 96.857 | 99.429 | 94.285 |
| 757.03 | 97.532 | 99.421 | 95.643 |
| 757.52 | 98.233 | 99.356 | 97.109 |
| 758.02 | 98.908 | 99.381 | 98.435 |
| 758.52 | 99.322 | 99.38 | 99.263 |
| 759.02 | 99.504 | 99.376 | 99.632 |
| 759.52 | 99.59 | 99.43 | 99.749 |
| 760.02 | 99.581 | 99.322 | 99.841 |
| 760.53 | 99.643 | 99.367 | 99.918 |
| 761.04 | 99.651 | 99.401 | 99.902 |
| 761.55 | 99.646 | 99.372 | 99.92 |
| 761.95 | 99.649 | 99.337 | 99.96 |
| 762.47 | 99.682 | 99.39 | 99.974 |
| 762.98 | 99.691 | 99.386 | 99.996 |
| 763.5 | 99.667 | 99.386 | 99.948 |
| 764.02 | 99.685 | 99.392 | 99.978 |
| 764.55 | 99.652 | 99.31 | 99.995 |
| 764.97 | 99.687 | 99.35 | 100.024 |
| 765.49 | 99.694 | 99.401 | 99.987 |
| 766.02 | 99.691 | 99.375 | 100.008 |
| 766.45 | 99.701 | 99.376 | 100.026 |
| 766.98 | 99.69 | 99.376 | 100.003 |
| 767.52 | 99.672 | 99.324 | 100.02 |
| 767.95 | 99.666 | 99.349 | 99.982 |
| 768.5 | 99.706 | 99.378 | 100.034 |
| 769.04 | 99.709 | 99.384 | 100.034 |
| 769.48 | 99.674 | 99.318 | 100.031 |
| 770.03 | 99.693 | 99.384 | 100.001 |
| 770.48 | 99.679 | 99.355 | 100.003 |
| 771.03 | 99.705 | 99.37 | 100.039 |
| 771.48 | 99.692 | 99.38 | 100.005 |
| 772.04 | 99.663 | 99.332 | 99.994 |
| 772.49 | 99.695 | 99.373 | 100.016 |
| 772.95 | 99.662 | 99.364 | 99.96 |
| 773.52 | 99.698 | 99.384 | 100.012 |
| 773.97 | 99.686 | 99.356 | 100.015 |
| 774.55 | 99.67 | 99.299 | 100.041 |
| 775.01 | 99.692 | 99.392 | 99.992 |
| 775.47 | 99.686 | 99.402 | 99.97 |
| 776.05 | 99.704 | 99.392 | 100.017 |
| 776.52 | 99.719 | 99.427 | 100.011 |
| 776.99 | 99.69 | 99.348 | 100.032 |
| 777.46 | 99.658 | 99.356 | 99.961 |
| 778.05 | 99.682 | 99.353 | 100.011 |
| 778.53 | 99.673 | 99.349 | 99.998 |
| 779.01 | 99.686 | 99.362 | 100.009 |
| 779.49 | 99.68 | 99.331 | 100.029 |
| 779.97 | 99.655 | 99.319 | 99.991 |
| 780.45 | 99.681 | 99.337 | 100.025 |
| 781.05 | 99.679 | 99.339 | 100.018 |
| 781.54 | 99.656 | 99.344 | 99.968 |
| 782.02 | 99.688 | 99.382 | 99.993 |
| 782.51 | 99.702 | 99.387 | 100.017 |
| 783.0 | 99.669 | 99.358 | 99.98 |
| 783.49 | 99.669 | 99.342 | 99.996 |
| 783.99 | 99.675 | 99.337 | 100.012 |
| 784.48 | 99.66 | 99.355 | 99.965 |
| 784.97 | 99.652 | 99.341 | 99.964 |
| 785.47 | 99.653 | 99.287 | 100.019 |
| 785.97 | 99.657 | 99.341 | 99.972 |
| 786.47 | 99.655 | 99.299 | 100.011 |
| 786.97 | 99.655 | 99.32 | 99.991 |
| 787.47 | 99.669 | 99.329 | 100.009 |
| 787.97 | 99.699 | 99.382 | 100.016 |
| 788.47 | 99.67 | 99.316 | 100.023 |
| 788.97 | 99.673 | 99.358 | 99.987 |
| 789.48 | 99.655 | 99.299 | 100.011 |
| 789.98 | 99.669 | 99.313 | 100.024 |
| 790.49 | 99.664 | 99.303 | 100.025 |
| 791.0 | 99.711 | 99.461 | 99.961 |
| 791.5 | 99.691 | 99.372 | 100.011 |
| 792.01 | 99.697 | 99.39 | 100.004 |
| 792.52 | 99.636 | 99.287 | 99.986 |
| 793.03 | 99.664 | 99.383 | 99.946 |
| 793.53 | 99.671 | 99.353 | 99.99 |
| 794.04 | 99.639 | 99.304 | 99.974 |
| 794.55 | 99.626 | 99.333 | 99.92 |
| 795.06 | 99.662 | 99.345 | 99.979 |
| 795.44 | 99.647 | 99.36 | 99.935 |
| 795.95 | 99.669 | 99.37 | 99.969 |
| 796.46 | 99.695 | 99.403 | 99.987 |
| 796.97 | 99.635 | 99.31 | 99.96 |
| 797.48 | 99.647 | 99.311 | 99.983 |
| 797.99 | 99.657 | 99.344 | 99.97 |
| 798.5 | 99.625 | 99.29 | 99.96 |
| 799.01 | 99.636 | 99.294 | 99.978 |
| 799.52 | 99.655 | 99.362 | 99.948 |
| 800.03 | 99.635 | 99.289 | 99.981 |
| 800.54 | 99.709 | 99.4 | 100.019 |
| 801.04 | 99.693 | 99.361 | 100.026 |
| 801.55 | 99.68 | 99.348 | 100.011 |
| 802.05 | 99.646 | 99.299 | 99.993 |
| 802.56 | 99.648 | 99.279 | 100.018 |
| 803.06 | 99.686 | 99.358 | 100.013 |
| 803.44 | 99.689 | 99.365 | 100.013 |
| 803.95 | 99.646 | 99.314 | 99.979 |
| 804.45 | 99.62 | 99.297 | 99.943 |
| 804.95 | 99.7 | 99.366 | 100.035 |
| 805.45 | 99.649 | 99.315 | 99.982 |
| 805.95 | 99.697 | 99.382 | 100.011 |
| 806.45 | 99.705 | 99.412 | 99.997 |
| 806.94 | 99.658 | 99.323 | 99.993 |
| 807.56 | 99.618 | 99.271 | 99.966 |
| 808.06 | 99.684 | 99.365 | 100.003 |
| 808.55 | 99.674 | 99.409 | 99.938 |
| 809.04 | 99.652 | 99.315 | 99.988 |
| 809.53 | 99.647 | 99.294 | 100 |
| 810.02 | 99.663 | 99.375 | 99.951 |
| 810.51 | 99.675 | 99.345 | 100.006 |
| 811.0 | 99.67 | 99.342 | 99.998 |
| 811.48 | 99.641 | 99.29 | 99.992 |
| 811.96 | 99.642 | 99.286 | 99.997 |
| 812.56 | 99.675 | 99.368 | 99.983 |
| 813.04 | 99.66 | 99.337 | 99.983 |
| 813.52 | 99.624 | 99.297 | 99.951 |
| 814.0 | 99.642 | 99.29 | 99.993 |
| 814.47 | 99.639 | 99.288 | 99.99 |
| 815.06 | 99.672 | 99.368 | 99.976 |
| 815.53 | 99.646 | 99.306 | 99.987 |
| 816.0 | 99.709 | 99.371 | 100.047 |
| 816.46 | 99.644 | 99.315 | 99.973 |
| 817.05 | 99.666 | 99.355 | 99.978 |
| 817.51 | 99.712 | 99.419 | 100.004 |
| 817.97 | 99.655 | 99.294 | 100.015 |
| 818.54 | 99.657 | 99.329 | 99.985 |
| 819.0 | 99.677 | 99.4 | 99.954 |
| 819.45 | 99.693 | 99.356 | 100.029 |
| 820.02 | 99.65 | 99.321 | 99.978 |
| 820.47 | 99.699 | 99.388 | 100.01 |
| 821.03 | 99.657 | 99.344 | 99.97 |
| 821.47 | 99.695 | 99.347 | 100.043 |
| 822.03 | 99.65 | 99.295 | 100.004 |
| 822.47 | 99.647 | 99.305 | 99.989 |
| 823.02 | 99.674 | 99.323 | 100.024 |
| 823.45 | 99.667 | 99.333 | 100.002 |
| 824.0 | 99.692 | 99.392 | 99.992 |
| 824.54 | 99.676 | 99.38 | 99.972 |
| 824.97 | 99.673 | 99.328 | 100.017 |
| 825.5 | 99.667 | 99.341 | 99.993 |
| 826.03 | 99.702 | 99.366 | 100.038 |
| 826.46 | 99.658 | 99.323 | 99.993 |
| 826.99 | 99.698 | 99.378 | 100.017 |
| 827.51 | 99.676 | 99.329 | 100.023 |
| 828.03 | 99.691 | 99.339 | 100.044 |
| 828.55 | 99.681 | 99.344 | 100.019 |
| 828.97 | 99.688 | 99.359 | 100.017 |
| 829.48 | 99.704 | 99.398 | 100.01 |
| 830.0 | 99.711 | 99.385 | 100.037 |
| 830.51 | 99.668 | 99.336 | 100 |
| 831.01 | 99.723 | 99.453 | 99.993 |
| 831.52 | 99.699 | 99.411 | 99.988 |
| 832.02 | 99.688 | 99.345 | 100.031 |
| 832.53 | 99.736 | 99.438 | 100.033 |
| 833.03 | 99.689 | 99.368 | 100.011 |
| 833.52 | 99.716 | 99.446 | 99.985 |
| 834.02 | 99.686 | 99.347 | 100.024 |
| 834.52 | 99.688 | 99.332 | 100.044 |
| 835.01 | 99.732 | 99.395 | 100.07 |
| 835.5 | 99.708 | 99.399 | 100.018 |
| 835.99 | 99.717 | 99.393 | 100.04 |
| 836.48 | 99.685 | 99.36 | 100.01 |
| 836.97 | 99.678 | 99.355 | 100 |
| 837.46 | 99.739 | 99.446 | 100.032 |
| 838.04 | 99.726 | 99.411 | 100.041 |
| 838.53 | 99.722 | 99.433 | 100.011 |
| 839.01 | 99.75 | 99.455 | 100.045 |
| 839.5 | 99.706 | 99.413 | 100 |
| 839.98 | 99.711 | 99.408 | 100.014 |
| 840.46 | 99.689 | 99.395 | 99.982 |
| 841.04 | 99.703 | 99.445 | 99.96 |
| 841.53 | 99.702 | 99.43 | 99.974 |
| 842.01 | 99.701 | 99.432 | 99.97 |
| 842.49 | 99.663 | 99.424 | 99.902 |
| 842.98 | 99.658 | 99.442 | 99.875 |
| 843.46 | 99.666 | 99.491 | 99.84 |
| 844.04 | 99.578 | 99.415 | 99.741 |
| 844.53 | 99.578 | 99.472 | 99.684 |
| 845.02 | 99.506 | 99.449 | 99.563 |
| 845.5 | 99.437 | 99.441 | 99.434 |
| 845.99 | 99.34 | 99.46 | 99.22 |
| 846.48 | 99.217 | 99.448 | 98.986 |
| 846.97 | 99.017 | 99.414 | 98.619 |
| 847.46 | 98.838 | 99.462 | 98.214 |
| 847.96 | 98.487 | 99.369 | 97.604 |
| 848.55 | 98.072 | 99.471 | 96.672 |
| 849.05 | 97.573 | 99.483 | 95.663 |
| 849.55 | 96.973 | 99.423 | 94.522 |
| 850.05 | 96.25 | 99.401 | 93.099 |
| 850.55 | 95.527 | 99.396 | 91.658 |
| 850.96 | 94.848 | 99.415 | 90.28 |
| 851.46 | 93.965 | 99.5 | 88.43 |
| 851.97 | 92.968 | 99.476 | 86.46 |
| 852.48 | 91.901 | 99.443 | 84.359 |
| 852.99 | 90.834 | 99.474 | 82.193 |
| 853.51 | 89.596 | 99.438 | 79.753 |
| 854.03 | 88.315 | 99.484 | 77.146 |
| 854.55 | 86.969 | 99.466 | 74.471 |
| 854.97 | 85.872 | 99.488 | 72.257 |
| 855.49 | 84.438 | 99.511 | 69.366 |
| 856.02 | 82.861 | 99.484 | 66.238 |
| 856.55 | 81.24 | 99.489 | 62.991 |
| 856.98 | 79.902 | 99.519 | 60.286 |
| 857.51 | 78.187 | 99.522 | 56.853 |
| 858.05 | 76.416 | 99.483 | 53.349 |
| 858.48 | 75.005 | 99.468 | 50.542 |
| 859.03 | 73.196 | 99.422 | 46.97 |
| 859.46 | 71.821 | 99.46 | 44.183 |
| 860.01 | 70.079 | 99.469 | 40.688 |
| 860.45 | 68.683 | 99.472 | 37.893 |
| 861.01 | 67.033 | 99.513 | 34.552 |
| 861.45 | 65.706 | 99.486 | 31.926 |
| 862.01 | 64.057 | 99.461 | 28.653 |
| 862.46 | 62.775 | 99.477 | 26.073 |
| 863.02 | 61.244 | 99.461 | 23.027 |
| 863.48 | 60.076 | 99.442 | 20.711 |
| 864.05 | 58.733 | 99.499 | 17.968 |
| 864.51 | 57.738 | 99.509 | 15.967 |
| 864.97 | 56.801 | 99.488 | 14.114 |
| 865.54 | 55.737 | 99.434 | 12.04 |
| 866.01 | 55.054 | 99.568 | 10.541 |
| 866.47 | 54.368 | 99.47 | 9.267 |
| 867.06 | 53.627 | 99.383 | 7.871 |
| 867.53 | 53.225 | 99.498 | 6.952 |
| 868.0 | 52.871 | 99.554 | 6.188 |
| 868.47 | 52.531 | 99.491 | 5.57 |
| 868.95 | 52.285 | 99.505 | 5.064 |
| 869.54 | 52.035 | 99.502 | 4.569 |
| 870.02 | 51.872 | 99.464 | 4.28 |
| 870.5 | 51.747 | 99.458 | 4.035 |
| 870.98 | 51.668 | 99.486 | 3.85 |
| 871.47 | 51.593 | 99.516 | 3.671 |
| 871.95 | 51.505 | 99.473 | 3.538 |
| 872.56 | 51.409 | 99.461 | 3.358 |
| 873.05 | 51.365 | 99.473 | 3.257 |
| 873.54 | 51.3 | 99.454 | 3.147 |
| 874.03 | 51.26 | 99.477 | 3.043 |
| 874.52 | 51.24 | 99.518 | 2.962 |
| 875.01 | 51.129 | 99.382 | 2.877 |
| 875.5 | 51.087 | 99.374 | 2.8 |
| 876.0 | 51.057 | 99.358 | 2.756 |
| 876.5 | 51 | 99.301 | 2.7 |
| 876.99 | 50.953 | 99.212 | 2.695 |
| 877.49 | 50.914 | 99.142 | 2.686 |
| 877.99 | 50.853 | 99.012 | 2.695 |
| 878.49 | 50.735 | 98.761 | 2.708 |
| 878.99 | 50.63 | 98.523 | 2.738 |
| 879.49 | 50.453 | 98.138 | 2.768 |
| 880.0 | 50.236 | 97.668 | 2.804 |
| 880.5 | 49.95 | 97.076 | 2.824 |
| 881.0 | 49.637 | 96.436 | 2.838 |
| 881.51 | 49.147 | 95.414 | 2.879 |
| 882.01 | 48.682 | 94.474 | 2.89 |
| 882.52 | 47.999 | 93.119 | 2.878 |
| 883.02 | 47.24 | 91.611 | 2.868 |
| 883.53 | 46.262 | 89.703 | 2.821 |
| 884.03 | 45.189 | 87.601 | 2.777 |
| 884.54 | 43.866 | 85.003 | 2.728 |
| 885.04 | 42.346 | 82.059 | 2.634 |
| 885.55 | 40.65 | 78.751 | 2.548 |
| 886.06 | 38.686 | 74.936 | 2.437 |
| 886.56 | 36.581 | 70.82 | 2.343 |
| 886.94 | 34.891 | 67.519 | 2.263 |
| 887.45 | 32.511 | 62.855 | 2.168 |
| 887.95 | 30.07 | 58.069 | 2.071 |
| 888.46 | 27.588 | 53.195 | 1.982 |
| 888.97 | 25.087 | 48.275 | 1.899 |
| 889.47 | 22.617 | 43.394 | 1.84 |
| 889.97 | 20.3 | 38.791 | 1.809 |
| 890.48 | 18.026 | 34.27 | 1.781 |
| 890.98 | 15.924 | 30.082 | 1.765 |
| 891.48 | 14.096 | 26.384 | 1.809 |
| 891.99 | 12.457 | 23.059 | 1.854 |
| 892.49 | 11.065 | 20.215 | 1.915 |
| 892.99 | 9.936 | 17.844 | 2.028 |
| 893.49 | 9.033 | 15.933 | 2.134 |
| 893.99 | 8.341 | 14.413 | 2.269 |
| 894.48 | 7.847 | 13.265 | 2.429 |
| 894.98 | 7.482 | 12.383 | 2.58 |
| 895.48 | 7.227 | 11.686 | 2.768 |
| 895.97 | 7.041 | 11.151 | 2.931 |
| 896.46 | 6.929 | 10.749 | 3.109 |
| 896.96 | 6.879 | 10.457 | 3.3 |
| 897.45 | 6.85 | 10.234 | 3.467 |
| 898.06 | 6.843 | 10.01 | 3.676 |
| 898.55 | 6.861 | 9.903 | 3.82 |
| 899.03 | 6.915 | 9.861 | 3.969 |
| 899.52 | 6.934 | 9.795 | 4.073 |
| 900.0 | 6.962 | 9.765 | 4.16 |
| 900.48 | 6.966 | 9.682 | 4.251 |
| 900.96 | 6.938 | 9.589 | 4.287 |
| 901.56 | 6.878 | 9.41 | 4.346 |
| 902.04 | 6.769 | 9.197 | 4.34 |
| 902.51 | 6.645 | 8.96 | 4.329 |
| 902.99 | 6.44 | 8.584 | 4.296 |
| 903.46 | 6.185 | 8.138 | 4.233 |
| 904.05 | 5.819 | 7.497 | 4.141 |
| 904.51 | 5.502 | 6.951 | 4.053 |
| 904.98 | 5.143 | 6.349 | 3.938 |
| 905.45 | 4.768 | 5.735 | 3.801 |
| 906.02 | 4.315 | 5.016 | 3.614 |
| 906.48 | 3.981 | 4.476 | 3.487 |
| 907.06 | 3.578 | 3.862 | 3.294 |
| 907.51 | 3.292 | 3.456 | 3.129 |
| 907.97 | 3.075 | 3.184 | 2.967 |
| 908.53 | 2.847 | 2.916 | 2.778 |
| 908.98 | 2.735 | 2.86 | 2.609 |
| 909.54 | 2.656 | 2.905 | 2.407 |
| 909.99 | 2.666 | 3.079 | 2.252 |
| 910.54 | 2.76 | 3.443 | 2.077 |
| 910.98 | 2.869 | 3.808 | 1.931 |
| 911.53 | 3.064 | 4.36 | 1.769 |
| 911.97 | 3.261 | 4.879 | 1.642 |
| 912.51 | 3.563 | 5.601 | 1.526 |
| 913.05 | 3.881 | 6.374 | 1.388 |
| 913.48 | 4.148 | 6.99 | 1.306 |
| 914.02 | 4.456 | 7.703 | 1.208 |
| 914.55 | 4.804 | 8.458 | 1.15 |
| 914.97 | 5.027 | 8.966 | 1.088 |
| 915.5 | 5.303 | 9.56 | 1.046 |
| 916.02 | 5.524 | 10.035 | 1.012 |
| 916.54 | 5.725 | 10.444 | 1.006 |
| 916.96 | 5.852 | 10.71 | 0.993 |
| 917.48 | 5.956 | 10.906 | 1.005 |
| 917.99 | 5.997 | 10.955 | 1.038 |
| 918.5 | 6.012 | 10.947 | 1.077 |
| 919.01 | 5.98 | 10.836 | 1.123 |
| 919.52 | 5.889 | 10.581 | 1.198 |
| 920.02 | 5.759 | 10.269 | 1.248 |
| 920.53 | 5.603 | 9.865 | 1.34 |
| 921.03 | 5.401 | 9.383 | 1.418 |
| 921.53 | 5.168 | 8.845 | 1.491 |
| 922.02 | 4.923 | 8.249 | 1.597 |
| 922.52 | 4.682 | 7.664 | 1.699 |
| 923.01 | 4.387 | 6.985 | 1.789 |
| 923.5 | 4.12 | 6.343 | 1.897 |
| 923.99 | 3.85 | 5.728 | 1.973 |
| 924.48 | 3.615 | 5.138 | 2.091 |
| 924.96 | 3.327 | 4.496 | 2.157 |
| 925.55 | 3.045 | 3.822 | 2.268 |
| 926.03 | 2.818 | 3.312 | 2.324 |
| 926.51 | 2.628 | 2.856 | 2.4 |
| 927.0 | 2.428 | 2.399 | 2.457 |
| 927.48 | 2.271 | 2.01 | 2.532 |
| 927.96 | 2.142 | 1.722 | 2.563 |
| 928.53 | 1.988 | 1.377 | 2.599 |
| 929.01 | 1.898 | 1.171 | 2.624 |
| 929.49 | 1.832 | 1.026 | 2.638 |
| 929.97 | 1.75 | 0.879 | 2.62 |
| 930.55 | 1.699 | 0.766 | 2.633 |
| 931.03 | 1.68 | 0.746 | 2.613 |
| 931.5 | 1.648 | 0.722 | 2.574 |
| 931.98 | 1.642 | 0.742 | 2.543 |
| 932.46 | 1.639 | 0.794 | 2.485 |
| 933.04 | 1.645 | 0.878 | 2.412 |
| 933.52 | 1.663 | 0.98 | 2.345 |
| 934.0 | 1.687 | 1.082 | 2.293 |
| 934.49 | 1.686 | 1.177 | 2.195 |
| 934.97 | 1.724 | 1.317 | 2.132 |
| 935.55 | 1.747 | 1.46 | 2.033 |
| 936.04 | 1.777 | 1.624 | 1.93 |
| 936.53 | 1.806 | 1.767 | 1.844 |
| 937.01 | 1.855 | 1.961 | 1.748 |
| 937.51 | 1.876 | 2.094 | 1.659 |
| 938.0 | 1.93 | 2.282 | 1.579 |
| 938.49 | 1.965 | 2.474 | 1.455 |
| 938.99 | 2.016 | 2.646 | 1.386 |
| 939.48 | 2.09 | 2.868 | 1.312 |
| 939.98 | 2.122 | 3.039 | 1.206 |
| 940.49 | 2.185 | 3.225 | 1.145 |
| 940.99 | 2.235 | 3.404 | 1.066 |
| 941.5 | 2.305 | 3.611 | 0.999 |
| 942.01 | 2.348 | 3.752 | 0.944 |
| 942.52 | 2.401 | 3.918 | 0.884 |
| 943.03 | 2.47 | 4.107 | 0.833 |
| 943.55 | 2.491 | 4.199 | 0.783 |
| 943.96 | 2.55 | 4.34 | 0.76 |
| 944.48 | 2.559 | 4.382 | 0.737 |
| 945.0 | 2.621 | 4.528 | 0.714 |
| 945.53 | 2.642 | 4.593 | 0.691 |
| 945.95 | 2.622 | 4.571 | 0.674 |
| 946.48 | 2.647 | 4.617 | 0.677 |
| 947.02 | 2.627 | 4.582 | 0.671 |
| 947.55 | 2.607 | 4.565 | 0.649 |
| 947.98 | 2.574 | 4.495 | 0.653 |
| 948.53 | 2.534 | 4.405 | 0.663 |
| 948.96 | 2.503 | 4.339 | 0.668 |
| 949.51 | 2.44 | 4.208 | 0.672 |
| 949.95 | 2.378 | 4.069 | 0.687 |
| 950.5 | 2.291 | 3.892 | 0.691 |
| 950.95 | 2.243 | 3.775 | 0.711 |
| 951.5 | 2.145 | 3.575 | 0.715 |
| 951.95 | 2.051 | 3.367 | 0.735 |
| 952.51 | 1.969 | 3.199 | 0.739 |
| 952.97 | 1.897 | 3.051 | 0.742 |
| 953.53 | 1.788 | 2.83 | 0.747 |
| 953.99 | 1.715 | 2.657 | 0.772 |
| 954.45 | 1.636 | 2.496 | 0.775 |
| 955.03 | 1.542 | 2.305 | 0.779 |
| 955.49 | 1.488 | 2.177 | 0.799 |
| 955.95 | 1.421 | 2.054 | 0.788 |
| 956.53 | 1.36 | 1.935 | 0.785 |
| 957.0 | 1.308 | 1.812 | 0.804 |
| 957.47 | 1.268 | 1.734 | 0.803 |
| 958.06 | 1.229 | 1.651 | 0.807 |
| 958.54 | 1.195 | 1.579 | 0.811 |
| 959.01 | 1.178 | 1.569 | 0.788 |
| 959.49 | 1.161 | 1.536 | 0.787 |
| 959.97 | 1.158 | 1.536 | 0.781 |
| 960.45 | 1.164 | 1.54 | 0.789 |
| 961.05 | 1.16 | 1.539 | 0.782 |
| 961.53 | 1.171 | 1.547 | 0.796 |
| 962.02 | 1.181 | 1.592 | 0.77 |
| 962.5 | 1.204 | 1.646 | 0.763 |
| 962.99 | 1.226 | 1.701 | 0.751 |
| 963.48 | 1.244 | 1.739 | 0.749 |
| 963.97 | 1.288 | 1.823 | 0.754 |
| 964.46 | 1.305 | 1.852 | 0.757 |
| 964.95 | 1.351 | 1.951 | 0.751 |
| 965.56 | 1.381 | 2.007 | 0.755 |
| 966.06 | 1.409 | 2.059 | 0.758 |
| 966.55 | 1.439 | 2.122 | 0.756 |
| 967.05 | 1.471 | 2.187 | 0.755 |
| 967.55 | 1.486 | 2.215 | 0.758 |
| 968.04 | 1.545 | 2.314 | 0.776 |
| 968.54 | 1.576 | 2.368 | 0.785 |
| 969.04 | 1.604 | 2.41 | 0.798 |
| 969.54 | 1.63 | 2.447 | 0.812 |
| 970.04 | 1.673 | 2.521 | 0.826 |
| 970.54 | 1.705 | 2.565 | 0.844 |
| 971.04 | 1.747 | 2.604 | 0.891 |
| 971.54 | 1.804 | 2.684 | 0.924 |
| 972.05 | 1.852 | 2.751 | 0.952 |
| 972.55 | 1.91 | 2.821 | 0.999 |
| 973.05 | 1.989 | 2.936 | 1.042 |
| 973.55 | 2.052 | 3.005 | 1.099 |
| 974.05 | 2.13 | 3.099 | 1.161 |
| 974.56 | 2.23 | 3.229 | 1.23 |
| 975.06 | 2.345 | 3.38 | 1.311 |
| 975.56 | 2.462 | 3.522 | 1.401 |
| 976.06 | 2.608 | 3.719 | 1.496 |
| 976.44 | 2.719 | 3.857 | 1.581 |
| 976.94 | 2.877 | 4.072 | 1.682 |
| 977.44 | 3.059 | 4.326 | 1.791 |
| 977.95 | 3.245 | 4.57 | 1.921 |
| 978.45 | 3.459 | 4.871 | 2.046 |
| 978.95 | 3.668 | 5.161 | 2.175 |
| 979.45 | 3.909 | 5.493 | 2.325 |
| 979.95 | 4.149 | 5.825 | 2.472 |
| 980.44 | 4.416 | 6.21 | 2.622 |
| 980.94 | 4.634 | 6.509 | 2.76 |
| 981.56 | 4.963 | 6.978 | 2.948 |
| 982.06 | 5.183 | 7.314 | 3.052 |
| 982.55 | 5.409 | 7.627 | 3.19 |
| 983.05 | 5.594 | 7.912 | 3.275 |
| 983.54 | 5.757 | 8.166 | 3.348 |
| 984.03 | 5.883 | 8.36 | 3.406 |
| 984.52 | 5.975 | 8.507 | 3.443 |
| 985.01 | 5.995 | 8.552 | 3.438 |
| 985.5 | 5.965 | 8.523 | 3.406 |
| 985.99 | 5.877 | 8.392 | 3.362 |
| 986.48 | 5.738 | 8.216 | 3.26 |
| 986.96 | 5.548 | 7.939 | 3.157 |
| 987.56 | 5.284 | 7.55 | 3.018 |
| 988.05 | 5.066 | 7.249 | 2.883 |
| 988.53 | 4.92 | 7.069 | 2.77 |
| 989.0 | 4.91 | 7.097 | 2.724 |
| 989.48 | 5.092 | 7.423 | 2.761 |
| 990.01 | 8.435 | 12.372 | 4.499 |
| 990.51 | 10.103 | 14.708 | 5.497 |
| 991.02 | 12.064 | 17.337 | 6.791 |
| 991.52 | 14.438 | 20.365 | 8.511 |
| 992.03 | 17.031 | 23.595 | 10.467 |
| 992.53 | 19.988 | 27.212 | 12.763 |
| 993.03 | 23.237 | 31.026 | 15.449 |
| 993.53 | 26.813 | 35.245 | 18.38 |
| 994.04 | 30.549 | 39.464 | 21.634 |
| 994.54 | 34.632 | 44.135 | 25.129 |
| 995.04 | 38.71 | 48.511 | 28.908 |
| 995.54 | 43.063 | 53.319 | 32.807 |
| 996.04 | 47.51 | 58.119 | 36.902 |
| 996.53 | 52.026 | 62.86 | 41.193 |
| 997.03 | 56.54 | 67.559 | 45.521 |
| 997.53 | 60.988 | 72.117 | 49.86 |
| 998.02 | 65.207 | 76.189 | 54.224 |
| 998.52 | 69.333 | 80.118 | 58.548 |
| 999.01 | 73.055 | 83.419 | 62.69 |
| 999.51 | 76.572 | 86.497 | 66.646 |
| 1000.0 | 79.718 | 88.986 | 70.449 |
| 1000.49 | 82.57 | 91.102 | 74.038 |
| 1000.98 | 85.004 | 92.785 | 77.223 |
| 1001.47 | 87.17 | 94.181 | 80.159 |
| 1001.96 | 89.038 | 95.307 | 82.769 |
| 1002.45 | 90.632 | 96.128 | 85.135 |
| 1002.94 | 92.023 | 96.843 | 87.203 |
| 1003.43 | 93.207 | 97.406 | 89.009 |
| 1003.92 | 94.15 | 97.834 | 90.467 |
| 1004.4 | 95.025 | 98.165 | 91.885 |
| 1004.89 | 95.754 | 98.463 | 93.044 |
| 1005.61 | 96.585 | 98.76 | 94.41 |
| 1006.09 | 97.078 | 98.911 | 95.246 |
| 1006.58 | 97.449 | 99.022 | 95.875 |
| 1007.06 | 97.801 | 99.114 | 96.488 |
| 1007.54 | 98.092 | 99.227 | 96.958 |
| 1008.02 | 98.36 | 99.29 | 97.43 |
| 1008.5 | 98.574 | 99.387 | 97.761 |
| 1008.97 | 98.737 | 99.422 | 98.052 |
| 1009.45 | 98.879 | 99.443 | 98.315 |
| 1009.92 | 98.994 | 99.438 | 98.551 |
| 1010.4 | 99.126 | 99.516 | 98.736 |
| 1011.11 | 99.272 | 99.545 | 98.998 |
| 1011.58 | 99.353 | 99.56 | 99.146 |
| 1012.05 | 99.43 | 99.589 | 99.271 |
| 1012.52 | 99.502 | 99.617 | 99.387 |
| 1012.99 | 99.57 | 99.656 | 99.484 |
| 1013.46 | 99.609 | 99.634 | 99.583 |
| 1013.93 | 99.651 | 99.662 | 99.64 |
| 1014.4 | 99.681 | 99.649 | 99.714 |
| 1015.09 | 99.713 | 99.646 | 99.78 |
| 1015.56 | 99.758 | 99.677 | 99.839 |
| 1016.02 | 99.79 | 99.693 | 99.887 |
| 1016.48 | 99.815 | 99.699 | 99.93 |
| 1016.95 | 99.818 | 99.68 | 99.957 |
| 1017.41 | 99.847 | 99.693 | 100 |
| 1018.1 | 99.877 | 99.716 | 100.038 |
| 1018.55 | 99.889 | 99.72 | 100.058 |
| 1019.01 | 99.906 | 99.718 | 100.094 |
| 1019.47 | 99.935 | 99.749 | 100.121 |
| 1019.92 | 99.938 | 99.747 | 100.128 |
| 1020.6 | 99.944 | 99.742 | 100.146 |
| 1021.06 | 99.957 | 99.741 | 100.174 |
| 1021.51 | 99.951 | 99.736 | 100.166 |
| 1021.96 | 99.983 | 99.759 | 100.208 |
| 1022.41 | 99.962 | 99.725 | 100.2 |
| 1023.08 | 99.977 | 99.72 | 100.233 |
| 1023.53 | 100.005 | 99.773 | 100.236 |
| 1023.98 | 99.99 | 99.76 | 100.221 |
| 1024.42 | 99.995 | 99.739 | 100.252 |
| 1025.09 | 100.006 | 99.752 | 100.26 |
| 1025.53 | 100.002 | 99.74 | 100.265 |
| 1025.97 | 100.029 | 99.771 | 100.287 |
| 1026.42 | 100.036 | 99.787 | 100.286 |
| 1027.08 | 100.025 | 99.766 | 100.284 |
| 1027.52 | 100.044 | 99.786 | 100.302 |
| 1027.95 | 100.051 | 99.793 | 100.309 |
| 1028.61 | 100.047 | 99.779 | 100.315 |
| 1029.04 | 100.037 | 99.758 | 100.315 |
| 1029.48 | 100.053 | 99.778 | 100.328 |
| 1029.91 | 100.051 | 99.773 | 100.328 |
| 1030.56 | 100.052 | 99.761 | 100.343 |
| 1031.0 | 100.063 | 99.792 | 100.333 |
| 1031.43 | 100.066 | 99.797 | 100.335 |
| 1032.07 | 100.08 | 99.811 | 100.349 |
| 1032.5 | 100.062 | 99.767 | 100.358 |
| 1032.93 | 100.094 | 99.808 | 100.381 |
| 1033.57 | 100.074 | 99.816 | 100.332 |
| 1033.99 | 100.09 | 99.803 | 100.378 |
| 1034.42 | 100.056 | 99.757 | 100.356 |
| 1035.06 | 100.073 | 99.783 | 100.363 |
| 1035.48 | 100.085 | 99.781 | 100.388 |
| 1035.9 | 100.079 | 99.813 | 100.344 |
| 1036.53 | 100.095 | 99.829 | 100.362 |
| 1036.95 | 100.083 | 99.786 | 100.38 |
| 1037.58 | 100.085 | 99.798 | 100.371 |
| 1038.0 | 100.101 | 99.831 | 100.372 |
| 1038.42 | 100.094 | 99.821 | 100.366 |
| 1039.04 | 100.083 | 99.776 | 100.389 |
| 1039.46 | 100.102 | 99.805 | 100.4 |
| 1040.08 | 100.116 | 99.836 | 100.396 |
| 1040.49 | 100.092 | 99.776 | 100.409 |
| 1040.91 | 100.091 | 99.808 | 100.373 |
| 1041.53 | 100.098 | 99.808 | 100.388 |
| 1041.94 | 100.091 | 99.807 | 100.375 |
| 1042.55 | 100.103 | 99.812 | 100.394 |
| 1042.96 | 100.145 | 99.855 | 100.436 |
| 1043.58 | 100.12 | 99.811 | 100.429 |
| 1043.99 | 100.105 | 99.819 | 100.392 |
| 1044.6 | 100.122 | 99.825 | 100.42 |
| 1045.01 | 100.107 | 99.812 | 100.402 |
| 1045.41 | 100.108 | 99.813 | 100.404 |
| 1046.02 | 100.119 | 99.836 | 100.401 |
| 1046.43 | 100.128 | 99.835 | 100.421 |
| 1047.03 | 100.122 | 99.828 | 100.416 |
| 1047.44 | 100.108 | 99.832 | 100.384 |
| 1048.04 | 100.12 | 99.821 | 100.419 |
| 1048.44 | 100.107 | 99.795 | 100.419 |
| 1049.05 | 100.117 | 99.813 | 100.421 |
| 1049.45 | 100.127 | 99.821 | 100.433 |
| 1050.05 | 100.114 | 99.828 | 100.4 |
| 1050.45 | 100.103 | 99.809 | 100.398 |
| 1051.05 | 100.122 | 99.836 | 100.407 |
| 1051.45 | 100.112 | 99.83 | 100.395 |
| 1052.05 | 100.135 | 99.862 | 100.408 |
| 1052.45 | 100.12 | 99.844 | 100.396 |
| 1053.04 | 100.116 | 99.84 | 100.391 |
| 1053.44 | 100.126 | 99.855 | 100.397 |
| 1054.04 | 100.127 | 99.853 | 100.401 |
| 1054.44 | 100.126 | 99.863 | 100.389 |
| 1055.03 | 100.121 | 99.83 | 100.411 |
| 1055.43 | 100.122 | 99.839 | 100.405 |
| 1056.02 | 100.106 | 99.804 | 100.407 |
| 1056.42 | 100.136 | 99.875 | 100.398 |
| 1057.01 | 100.128 | 99.85 | 100.406 |
| 1057.41 | 100.131 | 99.856 | 100.406 |
| 1058.0 | 100.155 | 99.907 | 100.403 |
| 1058.6 | 100.127 | 99.875 | 100.379 |
| 1058.99 | 100.133 | 99.843 | 100.423 |
| 1059.58 | 100.137 | 99.86 | 100.415 |
| 1059.98 | 100.14 | 99.861 | 100.419 |
| 1060.57 | 100.137 | 99.863 | 100.411 |
| 1060.97 | 100.133 | 99.875 | 100.392 |
| 1061.56 | 100.13 | 99.867 | 100.394 |
| 1061.95 | 100.153 | 99.894 | 100.412 |
| 1062.55 | 100.129 | 99.856 | 100.402 |
| 1062.94 | 100.121 | 99.858 | 100.385 |
| 1063.54 | 100.121 | 99.851 | 100.392 |
| 1063.93 | 100.147 | 99.897 | 100.397 |
| 1064.52 | 100.125 | 99.844 | 100.406 |
| 1064.92 | 100.11 | 99.861 | 100.36 |
| 1065.51 | 100.148 | 99.887 | 100.41 |
| 1065.91 | 100.13 | 99.864 | 100.396 |
| 1066.5 | 100.129 | 99.871 | 100.387 |
| 1067.1 | 100.133 | 99.864 | 100.402 |
| 1067.5 | 100.128 | 99.865 | 100.39 |
| 1068.09 | 100.129 | 99.867 | 100.391 |
| 1068.49 | 100.124 | 99.855 | 100.392 |
| 1069.09 | 100.142 | 99.894 | 100.39 |
| 1069.49 | 100.138 | 99.887 | 100.39 |
| 1070.08 | 100.133 | 99.867 | 100.399 |
| 1070.48 | 100.134 | 99.875 | 100.393 |
| 1071.08 | 100.142 | 99.888 | 100.396 |
| 1071.48 | 100.12 | 99.853 | 100.387 |
| 1072.08 | 100.12 | 99.875 | 100.365 |
| 1072.49 | 100.131 | 99.9 | 100.362 |
| 1073.09 | 100.128 | 99.885 | 100.372 |
| 1073.49 | 100.127 | 99.902 | 100.353 |
| 1074.09 | 100.128 | 99.896 | 100.359 |
| 1074.5 | 100.118 | 99.879 | 100.357 |
| 1075.1 | 100.138 | 99.89 | 100.385 |
| 1075.51 | 100.137 | 99.892 | 100.383 |
| 1075.91 | 100.118 | 99.877 | 100.359 |
| 1076.52 | 100.119 | 99.867 | 100.372 |
| 1076.93 | 100.128 | 99.881 | 100.375 |
| 1077.54 | 100.125 | 99.873 | 100.376 |
| 1077.95 | 100.126 | 99.879 | 100.373 |
| 1078.56 | 100.13 | 99.89 | 100.37 |
| 1078.97 | 100.106 | 99.84 | 100.372 |
| 1079.59 | 100.119 | 99.868 | 100.37 |
| 1080.0 | 100.139 | 99.868 | 100.41 |
| 1080.41 | 100.124 | 99.869 | 100.378 |
| 1081.03 | 100.12 | 99.884 | 100.356 |
| 1081.44 | 100.121 | 99.887 | 100.355 |
| 1082.06 | 100.11 | 99.859 | 100.361 |
| 1082.48 | 100.127 | 99.903 | 100.35 |
| 1083.1 | 100.131 | 99.901 | 100.36 |
| 1083.52 | 100.099 | 99.863 | 100.335 |
| 1083.94 | 100.116 | 99.869 | 100.363 |
| 1084.56 | 100.11 | 99.886 | 100.334 |
| 1084.98 | 100.109 | 99.892 | 100.327 |
| 1085.4 | 100.103 | 99.88 | 100.327 |
| 1086.03 | 100.103 | 99.88 | 100.326 |
| 1086.46 | 100.094 | 99.863 | 100.326 |
| 1087.09 | 100.095 | 99.879 | 100.311 |
| 1087.52 | 100.117 | 99.912 | 100.321 |
| 1087.94 | 100.114 | 99.897 | 100.33 |
| 1088.58 | 100.094 | 99.857 | 100.331 |
| 1089.01 | 100.099 | 99.884 | 100.314 |
| 1089.44 | 100.094 | 99.901 | 100.287 |
| 1090.08 | 100.08 | 99.857 | 100.304 |
| 1090.51 | 100.084 | 99.899 | 100.269 |
| 1090.94 | 100.089 | 99.892 | 100.285 |
| 1091.59 | 100.083 | 99.881 | 100.286 |
| 1092.02 | 100.062 | 99.859 | 100.264 |
| 1092.46 | 100.075 | 99.876 | 100.274 |
| 1093.11 | 100.061 | 99.877 | 100.245 |
| 1093.54 | 100.042 | 99.853 | 100.231 |
| 1093.98 | 100.038 | 99.868 | 100.207 |
| 1094.42 | 100.039 | 99.87 | 100.208 |
| 1095.08 | 100.055 | 99.916 | 100.195 |
| 1095.52 | 100.013 | 99.866 | 100.16 |
| 1095.96 | 100.028 | 99.905 | 100.152 |
| 1096.4 | 100.002 | 99.883 | 100.121 |
| 1097.07 | 99.996 | 99.882 | 100.11 |
| 1097.51 | 99.974 | 99.877 | 100.072 |
| 1097.96 | 99.96 | 99.871 | 100.048 |
| 1098.41 | 99.913 | 99.84 | 99.985 |
| 1099.08 | 99.896 | 99.856 | 99.936 |
| 1099.53 | 99.867 | 99.851 | 99.883 |
| 1099.98 | 99.828 | 99.853 | 99.803 |
| 1100.43 | 99.808 | 99.876 | 99.741 |
| 1101.1 | 99.72 | 99.864 | 99.576 |
| 1101.56 | 99.666 | 99.868 | 99.465 |
| 1102.01 | 99.57 | 99.871 | 99.27 |
| 1102.47 | 99.466 | 99.866 | 99.067 |
| 1102.92 | 99.333 | 99.864 | 98.803 |
| 1103.61 | 99.056 | 99.859 | 98.254 |
| 1104.07 | 98.814 | 99.9 | 97.728 |
| 1104.53 | 98.396 | 99.858 | 96.934 |
| 1104.99 | 97.957 | 99.863 | 96.05 |
| 1105.45 | 97.278 | 99.845 | 94.711 |
| 1105.91 | 96.556 | 99.892 | 93.22 |
| 1106.61 | 95.023 | 99.888 | 90.158 |
| 1107.07 | 93.901 | 99.889 | 87.913 |
| 1107.54 | 92.757 | 99.867 | 85.646 |
| 1108.0 | 91.622 | 99.903 | 83.341 |
| 1108.47 | 90.671 | 99.871 | 81.472 |
| 1108.94 | 89.795 | 99.867 | 79.724 |
| 1109.41 | 89.014 | 99.869 | 78.159 |
| 1110.11 | 88.115 | 99.863 | 76.367 |
| 1110.58 | 87.657 | 99.89 | 75.423 |
| 1111.06 | 87.285 | 99.851 | 74.718 |
| 1111.53 | 86.935 | 99.865 | 74.005 |
| 1112.0 | 86.642 | 99.885 | 73.4 |
| 1112.48 | 86.362 | 99.837 | 72.887 |
| 1112.96 | 86.152 | 99.865 | 72.439 |
| 1113.43 | 85.919 | 99.864 | 71.973 |
| 1113.91 | 85.725 | 99.855 | 71.595 |
| 1114.39 | 85.573 | 99.858 | 71.289 |
| 1115.11 | 85.483 | 99.864 | 71.102 |
| 1115.59 | 85.454 | 99.891 | 71.018 |
| 1116.07 | 85.389 | 99.872 | 70.907 |
| 1116.56 | 85.371 | 99.858 | 70.883 |
| 1117.04 | 85.404 | 99.874 | 70.934 |
| 1117.52 | 85.446 | 99.876 | 71.017 |
| 1118.01 | 85.582 | 99.869 | 71.294 |
| 1118.49 | 85.753 | 99.848 | 71.658 |
| 1118.98 | 86.139 | 99.853 | 72.424 |
| 1119.47 | 86.666 | 99.879 | 73.452 |
| 1119.96 | 87.385 | 99.862 | 74.908 |
| 1120.45 | 88.328 | 99.889 | 76.767 |
| 1120.94 | 89.336 | 99.871 | 78.8 |
| 1121.43 | 90.399 | 99.878 | 80.921 |
| 1121.92 | 91.454 | 99.898 | 83.01 |
| 1122.41 | 92.341 | 99.863 | 84.818 |
| 1122.91 | 93.136 | 99.883 | 86.389 |
| 1123.4 | 93.718 | 99.865 | 87.57 |
| 1123.89 | 94.147 | 99.853 | 88.44 |
| 1124.39 | 94.461 | 99.864 | 89.057 |
| 1124.89 | 94.654 | 99.887 | 89.422 |
| 1125.38 | 94.753 | 99.876 | 89.63 |
| 1125.88 | 94.78 | 99.875 | 89.685 |
| 1126.38 | 94.752 | 99.888 | 89.616 |
| 1126.88 | 94.655 | 99.858 | 89.453 |
| 1127.38 | 94.518 | 99.899 | 89.138 |
| 1127.88 | 94.298 | 99.862 | 88.735 |
| 1128.38 | 94.031 | 99.875 | 88.186 |
| 1128.88 | 93.717 | 99.906 | 87.527 |
| 1129.38 | 93.254 | 99.825 | 86.684 |
| 1129.88 | 92.782 | 99.892 | 85.672 |
| 1130.39 | 92.222 | 99.897 | 84.547 |
| 1130.89 | 91.515 | 99.871 | 83.159 |
| 1131.4 | 90.742 | 99.879 | 81.604 |
| 1131.9 | 89.846 | 99.868 | 79.823 |
| 1132.41 | 88.839 | 99.892 | 77.786 |
| 1132.91 | 87.704 | 99.895 | 75.513 |
| 1133.42 | 86.421 | 99.856 | 72.986 |
| 1133.93 | 85.138 | 99.883 | 70.392 |
| 1134.43 | 83.788 | 99.882 | 67.694 |
| 1134.94 | 82.291 | 99.838 | 64.744 |
| 1135.45 | 80.961 | 99.864 | 62.058 |
| 1135.96 | 79.45 | 99.832 | 59.067 |
| 1136.47 | 78.213 | 99.877 | 56.548 |
| 1136.98 | 76.886 | 99.85 | 53.922 |
| 1137.49 | 75.734 | 99.848 | 51.62 |
| 1138.0 | 74.69 | 99.829 | 49.551 |
| 1138.51 | 73.715 | 99.853 | 47.576 |
| 1139.02 | 72.937 | 99.844 | 46.03 |
| 1139.53 | 72.262 | 99.86 | 44.665 |
| 1140.05 | 71.639 | 99.837 | 43.44 |
| 1140.56 | 71.08 | 99.834 | 42.326 |
| 1141.07 | 70.664 | 99.842 | 41.487 |
| 1141.58 | 70.352 | 99.842 | 40.861 |
| 1142.1 | 70.113 | 99.836 | 40.389 |
| 1142.61 | 69.949 | 99.835 | 40.063 |
| 1143.13 | 69.862 | 99.842 | 39.882 |
| 1143.38 | 69.907 | 99.813 | 40.001 |
| 1143.9 | 70.005 | 99.821 | 40.189 |
| 1144.41 | 70.12 | 99.811 | 40.429 |
| 1144.93 | 70.43 | 99.814 | 41.046 |
| 1145.44 | 70.947 | 99.781 | 42.113 |
| 1145.96 | 71.425 | 99.747 | 43.102 |
| 1146.47 | 72.184 | 99.76 | 44.609 |
| 1146.99 | 73.013 | 99.713 | 46.313 |
| 1147.5 | 73.954 | 99.679 | 48.229 |
| 1148.02 | 75.13 | 99.604 | 50.655 |
| 1148.54 | 76.249 | 99.489 | 53.008 |
| 1149.05 | 77.483 | 99.31 | 55.656 |
| 1149.57 | 78.553 | 98.956 | 58.151 |
| 1150.08 | 79.621 | 98.336 | 60.906 |
| 1150.6 | 80.351 | 97.455 | 63.248 |
| 1151.12 | 80.914 | 96.074 | 65.754 |
| 1151.63 | 81.268 | 94.697 | 67.84 |
| 1151.89 | 81.363 | 93.824 | 68.901 |
| 1152.41 | 81.542 | 92.316 | 70.767 |
| 1152.92 | 81.665 | 91.025 | 72.306 |
| 1153.44 | 81.875 | 90.102 | 73.649 |
| 1153.96 | 82.124 | 89.494 | 74.754 |
| 1154.47 | 82.378 | 89.041 | 75.715 |
| 1154.99 | 82.599 | 88.685 | 76.512 |
| 1155.5 | 82.661 | 88.219 | 77.104 |
| 1156.02 | 82.71 | 87.837 | 77.583 |
| 1156.54 | 82.754 | 87.556 | 77.953 |
| 1157.05 | 82.756 | 87.353 | 78.159 |
| 1157.57 | 82.607 | 86.964 | 78.25 |
| 1158.08 | 82.581 | 86.883 | 78.278 |
| 1158.6 | 82.485 | 86.828 | 78.141 |
| 1159.11 | 82.484 | 87.033 | 77.934 |
| 1159.63 | 82.646 | 87.689 | 77.603 |
| 1159.88 | 82.788 | 88.19 | 77.386 |
| 1160.4 | 83.224 | 89.567 | 76.882 |
| 1160.91 | 83.753 | 91.201 | 76.305 |
| 1161.43 | 84.33 | 93.088 | 75.571 |
| 1161.94 | 84.723 | 94.659 | 74.786 |
| 1162.45 | 84.887 | 96.051 | 73.723 |
| 1162.97 | 84.825 | 97.016 | 72.634 |
| 1163.48 | 84.485 | 97.632 | 71.338 |
| 1163.99 | 83.964 | 97.915 | 70.012 |
| 1164.5 | 83.236 | 98.097 | 68.376 |
| 1165.01 | 82.461 | 98.208 | 66.714 |
| 1165.53 | 81.502 | 98.248 | 64.757 |
| 1166.04 | 80.565 | 98.255 | 62.875 |
| 1166.55 | 79.374 | 98.188 | 60.56 |
| 1167.06 | 78.233 | 98.145 | 58.322 |
| 1167.57 | 76.93 | 98.019 | 55.841 |
| 1168.08 | 75.667 | 97.92 | 53.414 |
| 1168.58 | 74.247 | 97.73 | 50.763 |
| 1169.09 | 72.874 | 97.546 | 48.201 |
| 1169.6 | 71.381 | 97.186 | 45.575 |
| 1170.11 | 69.974 | 96.804 | 43.143 |
| 1170.61 | 68.384 | 96.251 | 40.517 |
| 1171.12 | 66.91 | 95.542 | 38.277 |
| 1171.63 | 65.205 | 94.493 | 35.916 |
| 1171.88 | 64.372 | 93.827 | 34.917 |
| 1172.38 | 62.585 | 92.236 | 32.933 |
| 1172.89 | 60.634 | 90.087 | 31.181 |
| 1173.39 | 58.586 | 87.57 | 29.602 |
| 1173.89 | 56.326 | 84.535 | 28.116 |
| 1174.4 | 54.122 | 81.319 | 26.925 |
| 1174.9 | 52.138 | 78.208 | 26.067 |
| 1175.4 | 50.293 | 75.33 | 25.257 |
| 1175.9 | 48.758 | 72.824 | 24.691 |
| 1176.4 | 47.635 | 70.858 | 24.413 |
| 1176.9 | 46.778 | 69.26 | 24.295 |
| 1177.4 | 46.252 | 68.066 | 24.438 |
| 1177.9 | 45.858 | 66.906 | 24.81 |
| 1178.39 | 45.703 | 65.873 | 25.532 |
| 1178.89 | 45.863 | 65.347 | 26.379 |
| 1179.39 | 46.092 | 64.754 | 27.43 |
| 1179.88 | 46.668 | 64.556 | 28.78 |
| 1180.62 | 46.07 | 62.832 | 29.307 |
| 1181.12 | 47.058 | 62.989 | 31.128 |
| 1181.61 | 48.505 | 63.921 | 33.089 |
| 1182.1 | 50.114 | 65.144 | 35.084 |
| 1182.59 | 52.378 | 67.377 | 37.379 |
| 1183.08 | 54.744 | 69.994 | 39.494 |
| 1183.57 | 57.54 | 73.22 | 41.86 |
| 1184.06 | 60.292 | 76.567 | 44.018 |
| 1184.55 | 63.177 | 80.116 | 46.238 |
| 1185.03 | 65.789 | 83.194 | 48.384 |
| 1185.52 | 68.218 | 85.976 | 50.461 |
| 1186.01 | 70.219 | 88.061 | 52.376 |
| 1186.49 | 72.068 | 89.926 | 54.209 |
| 1186.97 | 73.51 | 91.22 | 55.8 |
| 1187.46 | 74.799 | 92.188 | 57.41 |
| 1187.94 | 75.849 | 92.961 | 58.737 |
| 1188.42 | 76.831 | 93.614 | 60.049 |
| 1188.9 | 77.565 | 94.017 | 61.113 |
| 1189.62 | 78.583 | 94.579 | 62.587 |
| 1190.1 | 79.097 | 94.816 | 63.377 |
| 1190.57 | 79.501 | 94.936 | 64.066 |
| 1191.05 | 79.869 | 95.118 | 64.62 |
| 1191.53 | 80.133 | 95.193 | 65.073 |
| 1192.0 | 80.363 | 95.274 | 65.452 |
| 1192.47 | 80.525 | 95.322 | 65.727 |
| 1192.95 | 80.615 | 95.327 | 65.902 |
| 1193.42 | 80.63 | 95.269 | 65.991 |
| 1193.89 | 80.593 | 95.182 | 66.003 |
| 1194.59 | 80.456 | 95.058 | 65.853 |
| 1195.06 | 80.27 | 94.909 | 65.63 |
| 1195.53 | 80.062 | 94.758 | 65.366 |
| 1195.99 | 79.767 | 94.564 | 64.97 |
| 1196.46 | 79.452 | 94.312 | 64.591 |
| 1196.92 | 79.021 | 94.012 | 64.031 |
| 1197.39 | 78.579 | 93.691 | 63.468 |
| 1198.08 | 77.706 | 93.051 | 62.362 |
| 1198.54 | 77.061 | 92.568 | 61.554 |
| 1199.0 | 76.332 | 91.981 | 60.684 |
| 1199.46 | 75.475 | 91.266 | 59.684 |
| 1199.92 | 74.536 | 90.403 | 58.67 |
| 1200.61 | 72.973 | 88.939 | 57.007 |
| 1201.06 | 71.801 | 87.754 | 55.848 |
| 1201.52 | 70.412 | 86.351 | 54.474 |
| 1201.97 | 68.92 | 84.659 | 53.182 |
| 1202.42 | 67.178 | 82.71 | 51.646 |
| 1203.1 | 64.382 | 79.379 | 49.386 |
| 1203.55 | 62.375 | 76.928 | 47.822 |
| 1204.0 | 60.29 | 74.391 | 46.189 |
| 1204.45 | 58.029 | 71.565 | 44.492 |
| 1204.9 | 55.704 | 68.625 | 42.783 |
| 1205.57 | 52.406 | 64.495 | 40.316 |
| 1206.01 | 50.102 | 61.663 | 38.541 |
| 1206.46 | 48.01 | 59.128 | 36.893 |
| 1206.9 | 45.872 | 56.625 | 35.119 |
| 1207.57 | 43.099 | 53.535 | 32.663 |
| 1208.01 | 41.4 | 51.785 | 31.015 |
| 1208.45 | 39.799 | 50.182 | 29.415 |
| 1209.11 | 37.856 | 48.438 | 27.274 |
| 1209.54 | 36.676 | 47.469 | 25.884 |
| 1209.98 | 35.8 | 46.915 | 24.685 |
| 1210.42 | 34.981 | 46.464 | 23.497 |
| 1211.07 | 34.064 | 46.251 | 21.877 |
| 1211.5 | 33.815 | 46.707 | 20.924 |
| 1211.94 | 33.67 | 47.247 | 20.094 |
| 1212.58 | 33.885 | 48.679 | 19.091 |
| 1213.01 | 34.43 | 50.276 | 18.584 |
| 1213.44 | 35.146 | 52.078 | 18.214 |
| 1214.09 | 36.674 | 55.547 | 17.8 |
| 1214.51 | 37.824 | 57.956 | 17.691 |
| 1214.94 | 39.254 | 60.649 | 17.859 |
| 1215.58 | 41.53 | 64.933 | 18.127 |
| 1216.0 | 42.988 | 67.531 | 18.445 |
| 1216.43 | 44.6 | 70.237 | 18.964 |
| 1217.06 | 46.949 | 73.939 | 19.959 |
| 1217.48 | 48.439 | 76.128 | 20.75 |
| 1217.9 | 49.836 | 78.007 | 21.666 |
| 1218.53 | 51.812 | 80.471 | 23.153 |
| 1218.95 | 53.178 | 82.025 | 24.331 |
| 1219.58 | 54.995 | 83.808 | 26.181 |
| 1220.0 | 56.17 | 84.836 | 27.503 |
| 1220.41 | 57.315 | 85.745 | 28.886 |
| 1221.04 | 58.881 | 86.786 | 30.976 |
| 1221.45 | 59.944 | 87.41 | 32.477 |
| 1222.07 | 61.421 | 88.176 | 34.667 |
| 1222.48 | 62.393 | 88.62 | 36.166 |
| 1223.1 | 63.743 | 89.153 | 38.334 |
| 1223.51 | 64.56 | 89.398 | 39.721 |
| 1223.92 | 65.439 | 89.684 | 41.194 |
| 1224.53 | 66.592 | 89.947 | 43.237 |
| 1224.94 | 67.33 | 90.102 | 44.558 |
| 1225.55 | 68.359 | 90.316 | 46.402 |
| 1225.96 | 68.93 | 90.352 | 47.508 |
| 1226.57 | 69.835 | 90.438 | 49.233 |
| 1226.98 | 70.377 | 90.461 | 50.293 |
| 1227.58 | 71.054 | 90.382 | 51.726 |
| 1227.99 | 71.467 | 90.308 | 52.625 |
| 1228.59 | 71.988 | 90.149 | 53.826 |
| 1229.0 | 72.299 | 90.017 | 54.581 |
| 1229.6 | 72.662 | 89.733 | 55.591 |
| 1230.0 | 72.828 | 89.508 | 56.147 |
| 1230.6 | 73.041 | 89.107 | 56.975 |
| 1231.0 | 73.104 | 88.805 | 57.403 |
| 1231.6 | 73.116 | 88.281 | 57.951 |
| 1232.0 | 73.065 | 87.835 | 58.294 |
| 1232.6 | 72.91 | 87.141 | 58.68 |
| 1233.0 | 72.706 | 86.517 | 58.894 |
| 1233.6 | 72.32 | 85.551 | 59.089 |
| 1233.99 | 72.031 | 84.911 | 59.151 |
| 1234.59 | 71.415 | 83.659 | 59.17 |
| 1234.98 | 70.907 | 82.683 | 59.13 |
| 1235.58 | 70.006 | 81.01 | 59.003 |
| 1235.97 | 69.319 | 79.827 | 58.812 |
| 1236.57 | 68.106 | 77.74 | 58.471 |
| 1236.96 | 67.208 | 76.227 | 58.19 |
| 1237.56 | 65.67 | 73.669 | 57.67 |
| 1237.95 | 64.55 | 71.824 | 57.276 |
| 1238.54 | 62.729 | 68.859 | 56.599 |
| 1238.94 | 61.441 | 66.778 | 56.105 |
| 1239.53 | 59.414 | 63.552 | 55.276 |
| 1239.92 | 57.892 | 61.181 | 54.603 |
| 1240.51 | 55.674 | 57.761 | 53.588 |
| 1241.1 | 53.608 | 54.714 | 52.501 |
| 1241.5 | 52.084 | 52.548 | 51.62 |
| 1242.09 | 49.97 | 49.639 | 50.3 |
| 1242.48 | 48.665 | 47.987 | 49.344 |
| 1243.07 | 46.706 | 45.551 | 47.861 |
| 1243.46 | 45.566 | 44.216 | 46.916 |
| 1244.05 | 43.868 | 42.545 | 45.19 |
| 1244.44 | 42.864 | 41.664 | 44.064 |
| 1245.04 | 41.531 | 40.714 | 42.349 |
| 1245.43 | 40.712 | 40.351 | 41.074 |
| 1246.02 | 39.724 | 40.255 | 39.194 |
| 1246.41 | 39.131 | 40.375 | 37.886 |
| 1247.0 | 38.643 | 41.305 | 35.981 |
| 1247.59 | 38.251 | 42.426 | 34.076 |
| 1247.99 | 38.274 | 43.738 | 32.81 |
| 1248.58 | 38.403 | 45.946 | 30.859 |
| 1248.98 | 38.621 | 47.53 | 29.712 |
| 1249.57 | 39.178 | 50.52 | 27.836 |
| 1249.96 | 39.642 | 52.628 | 26.657 |
| 1250.56 | 40.408 | 55.847 | 24.969 |
| 1250.95 | 41.034 | 58.212 | 23.855 |
| 1251.55 | 41.96 | 61.574 | 22.345 |
| 1251.95 | 42.599 | 63.767 | 21.431 |
| 1252.54 | 43.544 | 66.933 | 20.154 |
| 1252.94 | 44.114 | 68.8 | 19.428 |
| 1253.54 | 45.023 | 71.634 | 18.412 |
| 1253.94 | 45.59 | 73.279 | 17.901 |
| 1254.53 | 46.314 | 75.429 | 17.2 |
| 1254.93 | 46.796 | 76.753 | 16.84 |
| 1255.53 | 47.526 | 78.518 | 16.534 |
| 1255.93 | 47.964 | 79.502 | 16.426 |
| 1256.54 | 48.709 | 80.882 | 16.536 |
| 1256.94 | 49.202 | 81.711 | 16.693 |
| 1257.54 | 49.918 | 82.762 | 17.073 |
| 1257.95 | 50.448 | 83.375 | 17.521 |
| 1258.55 | 51.199 | 84.183 | 18.216 |
| 1258.96 | 51.777 | 84.651 | 18.904 |
| 1259.56 | 52.648 | 85.276 | 20.02 |
| 1259.97 | 53.182 | 85.588 | 20.775 |
| 1260.58 | 54.123 | 86.047 | 22.198 |
| 1260.99 | 54.735 | 86.248 | 23.222 |
| 1261.6 | 55.685 | 86.546 | 24.825 |
| 1262.01 | 56.337 | 86.722 | 25.952 |
| 1262.42 | 57.028 | 86.86 | 27.197 |
| 1263.04 | 57.993 | 86.984 | 29.002 |
| 1263.45 | 58.578 | 87.045 | 30.11 |
| 1264.07 | 59.562 | 87.048 | 32.075 |
| 1264.48 | 60.193 | 87.056 | 33.33 |
| 1265.1 | 61.057 | 86.996 | 35.119 |
| 1265.51 | 61.629 | 86.867 | 36.39 |
| 1265.93 | 62.18 | 86.771 | 37.589 |
| 1266.56 | 62.958 | 86.557 | 39.36 |
| 1266.97 | 63.419 | 86.34 | 40.498 |
| 1267.6 | 64.052 | 85.999 | 42.106 |
| 1268.02 | 64.462 | 85.72 | 43.204 |
| 1268.44 | 64.756 | 85.396 | 44.116 |
| 1269.07 | 65.247 | 84.837 | 45.656 |
| 1269.49 | 65.482 | 84.406 | 46.557 |
| 1269.92 | 65.672 | 83.959 | 47.385 |
| 1270.55 | 65.898 | 83.164 | 48.631 |
| 1270.98 | 65.942 | 82.576 | 49.309 |
| 1271.41 | 65.999 | 81.948 | 50.049 |
| 1272.05 | 65.896 | 80.807 | 50.985 |
| 1272.47 | 65.779 | 80.01 | 51.547 |
| 1272.9 | 65.578 | 79.08 | 52.075 |
| 1273.55 | 65.166 | 77.581 | 52.752 |
| 1273.98 | 64.8 | 76.439 | 53.162 |
| 1274.41 | 64.417 | 75.306 | 53.527 |
| 1275.06 | 63.597 | 73.219 | 53.975 |
| 1275.5 | 63.018 | 71.807 | 54.229 |
| 1275.93 | 62.328 | 70.247 | 54.409 |
| 1276.59 | 61.19 | 67.758 | 54.622 |
| 1277.02 | 60.395 | 66.094 | 54.697 |
| 1277.46 | 59.447 | 64.158 | 54.735 |
| 1277.9 | 58.503 | 62.25 | 54.756 |
| 1278.56 | 56.962 | 59.263 | 54.66 |
| 1279.0 | 55.91 | 57.252 | 54.568 |
| 1279.45 | 54.849 | 55.276 | 54.421 |
| 1280.11 | 53.215 | 52.359 | 54.071 |
| 1280.56 | 52.192 | 50.552 | 53.832 |
| 1281.0 | 51.127 | 48.736 | 53.518 |
| 1281.45 | 50.182 | 47.183 | 53.181 |
| 1281.9 | 49.181 | 45.603 | 52.759 |
| 1282.57 | 47.904 | 43.72 | 52.087 |
| 1283.02 | 47.096 | 42.593 | 51.599 |
| 1283.47 | 46.365 | 41.704 | 51.026 |
| 1283.93 | 45.679 | 40.969 | 50.388 |
| 1284.61 | 44.82 | 40.281 | 49.36 |
| 1285.06 | 44.419 | 40.141 | 48.697 |
| 1285.52 | 44.067 | 40.232 | 47.902 |
| 1285.97 | 43.792 | 40.494 | 47.089 |
| 1286.43 | 43.646 | 41.077 | 46.215 |
| 1286.89 | 43.592 | 41.87 | 45.314 |
| 1287.58 | 43.636 | 43.439 | 43.834 |
| 1288.04 | 43.859 | 44.842 | 42.876 |
| 1288.5 | 44.098 | 46.388 | 41.808 |
| 1288.96 | 44.424 | 48.073 | 40.775 |
| 1289.43 | 44.805 | 49.927 | 39.684 |
| 1289.89 | 45.218 | 51.878 | 38.559 |
| 1290.59 | 45.896 | 54.961 | 36.831 |
| 1291.06 | 46.365 | 57.053 | 35.678 |
| 1291.52 | 46.807 | 59.055 | 34.558 |
| 1291.99 | 47.255 | 61.214 | 33.296 |
| 1292.46 | 47.683 | 63.18 | 32.186 |
| 1292.93 | 48.066 | 65.115 | 31.017 |
| 1293.4 | 48.394 | 66.859 | 29.929 |
| 1294.11 | 48.829 | 69.479 | 28.18 |
| 1294.59 | 49.021 | 70.933 | 27.109 |
| 1295.06 | 49.232 | 72.386 | 26.078 |
| 1295.54 | 49.403 | 73.709 | 25.096 |
| 1296.01 | 49.526 | 74.933 | 24.12 |
| 1296.49 | 49.647 | 76.025 | 23.269 |
| 1296.97 | 49.753 | 77.077 | 22.43 |
| 1297.45 | 49.827 | 78.009 | 21.646 |
| 1297.93 | 49.919 | 78.867 | 20.971 |
| 1298.41 | 50.026 | 79.674 | 20.378 |
| 1298.89 | 50.079 | 80.305 | 19.852 |
| 1299.61 | 50.234 | 81.209 | 19.259 |
| 1300.1 | 50.446 | 81.678 | 19.214 |
| 1300.58 | 50.574 | 82.145 | 19.004 |
| 1301.07 | 50.754 | 82.589 | 18.919 |
| 1301.55 | 50.934 | 83.005 | 18.862 |
| 1302.04 | 51.119 | 83.3 | 18.937 |
| 1302.53 | 51.365 | 83.634 | 19.096 |
| 1303.02 | 51.582 | 83.856 | 19.307 |
| 1303.51 | 51.897 | 84.095 | 19.698 |
| 1304.0 | 52.158 | 84.259 | 20.056 |
| 1304.49 | 52.492 | 84.405 | 20.578 |
| 1304.98 | 52.803 | 84.495 | 21.112 |
| 1305.47 | 53.191 | 84.579 | 21.803 |
| 1305.96 | 53.557 | 84.595 | 22.52 |
| 1306.46 | 53.985 | 84.613 | 23.357 |
| 1306.95 | 54.343 | 84.567 | 24.118 |
| 1307.45 | 54.825 | 84.554 | 25.096 |
| 1307.94 | 55.229 | 84.452 | 26.006 |
| 1308.44 | 55.682 | 84.322 | 27.042 |
| 1308.94 | 56.078 | 84.174 | 27.981 |
| 1309.43 | 56.488 | 83.939 | 29.037 |
| 1309.93 | 56.894 | 83.733 | 30.056 |
| 1310.43 | 57.343 | 83.465 | 31.221 |
| 1310.93 | 57.705 | 83.175 | 32.234 |
| 1311.43 | 58.089 | 82.79 | 33.389 |
| 1311.93 | 58.406 | 82.418 | 34.394 |
| 1312.43 | 58.746 | 81.996 | 35.497 |
| 1312.94 | 59.04 | 81.583 | 36.498 |
| 1313.44 | 59.308 | 81.043 | 37.572 |
| 1313.94 | 59.508 | 80.458 | 38.558 |
| 1314.44 | 59.738 | 79.851 | 39.624 |
| 1314.95 | 59.826 | 79.145 | 40.506 |
| 1315.45 | 59.909 | 78.375 | 41.443 |
| 1315.96 | 59.932 | 77.6 | 42.265 |
| 1316.47 | 59.88 | 76.656 | 43.105 |
| 1316.97 | 59.824 | 75.774 | 43.874 |
| 1317.48 | 59.688 | 74.715 | 44.66 |
| 1317.99 | 59.463 | 73.624 | 45.303 |
| 1318.49 | 59.234 | 72.484 | 45.985 |
| 1319.0 | 58.925 | 71.292 | 46.558 |
| 1319.51 | 58.532 | 69.919 | 47.145 |
| 1320.02 | 58.106 | 68.549 | 47.662 |
| 1320.53 | 57.594 | 67.047 | 48.142 |
| 1321.04 | 57.106 | 65.662 | 48.551 |
| 1321.55 | 56.503 | 64.059 | 48.947 |
| 1322.06 | 55.871 | 62.467 | 49.275 |
| 1322.57 | 55.205 | 60.815 | 49.596 |
| 1323.08 | 54.576 | 59.336 | 49.816 |
| 1323.59 | 53.848 | 57.711 | 49.986 |
| 1324.1 | 53.205 | 56.257 | 50.154 |
| 1324.61 | 52.458 | 54.67 | 50.245 |
| 1325.13 | 51.8 | 53.269 | 50.331 |
| 1325.38 | 51.436 | 52.52 | 50.351 |
| 1325.89 | 50.77 | 51.193 | 50.347 |
| 1326.41 | 50.133 | 49.97 | 50.297 |
| 1326.92 | 49.543 | 48.888 | 50.198 |
| 1327.43 | 48.992 | 47.912 | 50.073 |
| 1327.95 | 48.477 | 47.09 | 49.864 |
| 1328.46 | 48.058 | 46.487 | 49.63 |
| 1328.97 | 47.666 | 45.951 | 49.38 |
| 1329.49 | 47.353 | 45.629 | 49.078 |
| 1330.0 | 47.104 | 45.494 | 48.713 |
| 1330.51 | 46.939 | 45.577 | 48.3 |
| 1331.03 | 46.792 | 45.726 | 47.858 |
| 1331.54 | 46.751 | 46.134 | 47.367 |
| 1332.06 | 46.751 | 46.656 | 46.847 |
| 1332.57 | 46.833 | 47.393 | 46.272 |
| 1333.08 | 46.958 | 48.271 | 45.645 |
| 1333.6 | 47.157 | 49.288 | 45.026 |
| 1334.11 | 47.378 | 50.465 | 44.291 |
| 1334.63 | 47.661 | 51.77 | 43.552 |
| 1334.88 | 47.796 | 52.428 | 43.164 |
| 1335.4 | 48.069 | 53.748 | 42.39 |
| 1335.91 | 48.437 | 55.332 | 41.543 |
| 1336.43 | 48.732 | 56.805 | 40.658 |
| 1336.94 | 49.056 | 58.372 | 39.74 |
| 1337.45 | 49.388 | 59.878 | 38.898 |
| 1337.97 | 49.697 | 61.468 | 37.925 |
| 1338.48 | 49.972 | 62.962 | 36.981 |
| 1338.99 | 50.17 | 64.45 | 35.89 |
| 1339.51 | 50.397 | 65.835 | 34.958 |
| 1340.02 | 50.595 | 67.314 | 33.877 |
| 1340.53 | 50.715 | 68.535 | 32.894 |
| 1341.05 | 50.816 | 69.815 | 31.817 |
| 1341.56 | 50.927 | 70.969 | 30.885 |
| 1342.07 | 50.95 | 72.127 | 29.773 |
| 1342.58 | 50.944 | 73.099 | 28.789 |
| 1343.09 | 50.9 | 74.066 | 27.734 |
| 1343.61 | 50.847 | 74.896 | 26.799 |
| 1344.12 | 50.766 | 75.728 | 25.804 |
| 1344.63 | 50.674 | 76.485 | 24.862 |
| 1344.88 | 50.64 | 76.829 | 24.452 |
| 1345.39 | 50.515 | 77.485 | 23.544 |
| 1345.9 | 50.404 | 78.102 | 22.705 |
| 1346.41 | 50.325 | 78.69 | 21.959 |
| 1346.92 | 50.201 | 79.171 | 21.231 |
| 1347.43 | 50.081 | 79.579 | 20.583 |
| 1347.94 | 49.97 | 79.981 | 19.959 |
| 1348.45 | 49.888 | 80.37 | 19.405 |
| 1348.96 | 49.814 | 80.686 | 18.942 |
| 1349.46 | 49.777 | 81.022 | 18.533 |
| 1349.97 | 49.708 | 81.22 | 18.195 |
| 1350.48 | 49.677 | 81.407 | 17.948 |
| 1350.98 | 49.675 | 81.561 | 17.788 |
| 1351.49 | 49.694 | 81.722 | 17.667 |
| 1351.99 | 49.735 | 81.826 | 17.644 |
| 1352.5 | 49.803 | 81.921 | 17.685 |
| 1353.0 | 49.883 | 81.946 | 17.82 |
| 1353.5 | 49.988 | 81.955 | 18.02 |
| 1354.01 | 50.13 | 81.959 | 18.301 |
| 1354.51 | 50.283 | 81.913 | 18.654 |
| 1355.01 | 50.438 | 81.803 | 19.074 |
| 1355.51 | 50.613 | 81.666 | 19.56 |
| 1356.01 | 50.803 | 81.533 | 20.073 |
| 1356.51 | 51.022 | 81.388 | 20.656 |
| 1357.01 | 51.239 | 81.176 | 21.303 |
| 1357.51 | 51.457 | 80.926 | 21.987 |
| 1358.01 | 51.668 | 80.646 | 22.69 |
| 1358.5 | 51.904 | 80.331 | 23.477 |
| 1359.0 | 52.114 | 80.008 | 24.22 |
| 1359.5 | 52.34 | 79.617 | 25.063 |
| 1359.99 | 52.574 | 79.212 | 25.936 |
| 1360.48 | 52.775 | 78.709 | 26.842 |
| 1360.98 | 52.966 | 78.245 | 27.687 |
| 1361.47 | 53.119 | 77.671 | 28.567 |
| 1361.96 | 53.272 | 77.101 | 29.444 |
| 1362.45 | 53.403 | 76.471 | 30.335 |
| 1362.95 | 53.509 | 75.807 | 31.21 |
| 1363.44 | 53.573 | 75.064 | 32.081 |
| 1363.92 | 53.631 | 74.306 | 32.956 |
| 1364.41 | 53.648 | 73.51 | 33.786 |
| 1364.9 | 53.598 | 72.642 | 34.555 |
| 1365.39 | 53.537 | 71.714 | 35.36 |
| 1366.12 | 53.35 | 70.2 | 36.499 |
| 1366.6 | 53.197 | 69.173 | 37.221 |
| 1367.09 | 52.979 | 68.038 | 37.921 |
| 1367.57 | 52.727 | 66.91 | 38.544 |
| 1368.05 | 52.454 | 65.706 | 39.201 |
| 1368.53 | 52.163 | 64.537 | 39.789 |
| 1369.01 | 51.802 | 63.246 | 40.358 |
| 1369.49 | 51.428 | 61.969 | 40.887 |
| 1369.97 | 51.002 | 60.604 | 41.399 |
| 1370.45 | 50.601 | 59.371 | 41.831 |
| 1370.93 | 50.18 | 58.077 | 42.283 |
| 1371.4 | 49.744 | 56.823 | 42.666 |
| 1372.11 | 49.039 | 54.89 | 43.188 |
| 1372.59 | 48.565 | 53.632 | 43.498 |
| 1373.06 | 48.094 | 52.423 | 43.764 |
| 1373.53 | 47.668 | 51.354 | 43.983 |
| 1374.01 | 47.234 | 50.271 | 44.197 |
| 1374.48 | 46.821 | 49.269 | 44.373 |
| 1374.95 | 46.448 | 48.401 | 44.495 |
| 1375.41 | 46.064 | 47.544 | 44.583 |
| 1376.11 | 45.604 | 46.521 | 44.686 |
| 1376.58 | 45.294 | 45.897 | 44.69 |
| 1377.05 | 45.076 | 45.441 | 44.712 |
| 1377.51 | 44.868 | 45.079 | 44.658 |
| 1377.97 | 44.726 | 44.856 | 44.597 |
| 1378.44 | 44.596 | 44.691 | 44.5 |
| 1378.9 | 44.511 | 44.643 | 44.378 |
| 1379.59 | 44.474 | 44.824 | 44.124 |
| 1380.05 | 44.504 | 45.062 | 43.945 |
| 1380.5 | 44.547 | 45.382 | 43.712 |
| 1380.96 | 44.643 | 45.804 | 43.482 |
| 1381.42 | 44.762 | 46.327 | 43.197 |
| 1382.1 | 45.035 | 47.322 | 42.747 |
| 1382.55 | 45.194 | 47.961 | 42.427 |
| 1383.01 | 45.407 | 48.769 | 42.046 |
| 1383.46 | 45.653 | 49.613 | 41.694 |
| 1383.91 | 45.877 | 50.485 | 41.269 |
| 1384.58 | 46.293 | 51.959 | 40.626 |
| 1385.03 | 46.563 | 52.96 | 40.167 |
| 1385.48 | 46.843 | 53.951 | 39.736 |
| 1385.93 | 47.105 | 54.988 | 39.223 |
| 1386.59 | 47.496 | 56.551 | 38.441 |
| 1387.04 | 47.769 | 57.598 | 37.941 |
| 1387.48 | 47.984 | 58.62 | 37.348 |
| 1387.92 | 48.2 | 59.589 | 36.81 |
| 1388.58 | 48.495 | 61.107 | 35.883 |
| 1389.02 | 48.673 | 62.055 | 35.29 |
| 1389.46 | 48.869 | 63.013 | 34.725 |
| 1389.9 | 49.011 | 63.957 | 34.066 |
| 1390.56 | 49.205 | 65.278 | 33.131 |
| 1390.99 | 49.292 | 66.125 | 32.46 |
| 1391.43 | 49.379 | 66.906 | 31.851 |
| 1392.08 | 49.477 | 68.141 | 30.812 |
| 1392.51 | 49.485 | 68.814 | 30.157 |
| 1392.94 | 49.526 | 69.549 | 29.503 |
| 1393.59 | 49.498 | 70.512 | 28.484 |
| 1394.01 | 49.456 | 71.088 | 27.824 |
| 1394.44 | 49.432 | 71.706 | 27.158 |
| 1395.08 | 49.356 | 72.55 | 26.162 |
| 1395.51 | 49.285 | 73.046 | 25.524 |
| 1395.93 | 49.218 | 73.554 | 24.882 |
| 1396.57 | 49.064 | 74.191 | 23.938 |
| 1396.99 | 48.941 | 74.573 | 23.309 |
| 1397.42 | 48.821 | 74.91 | 22.732 |
| 1398.05 | 48.675 | 75.479 | 21.872 |
| 1398.47 | 48.54 | 75.766 | 21.313 |
| 1399.1 | 48.371 | 76.229 | 20.513 |
| 1399.52 | 48.251 | 76.507 | 19.994 |
| 1399.93 | 48.129 | 76.727 | 19.531 |
| 1400.56 | 47.95 | 77.057 | 18.843 |
| 1400.97 | 47.837 | 77.243 | 18.432 |
| 1401.59 | 47.654 | 77.423 | 17.885 |
| 1402.01 | 47.556 | 77.61 | 17.503 |
| 1402.42 | 47.452 | 77.709 | 17.195 |
| 1403.04 | 47.332 | 77.877 | 16.787 |
| 1403.45 | 47.226 | 77.916 | 16.537 |
| 1404.06 | 47.128 | 78.012 | 16.244 |
| 1404.47 | 47.067 | 78.067 | 16.067 |
| 1405.09 | 46.993 | 78.104 | 15.882 |
| 1405.49 | 46.924 | 78.059 | 15.789 |
| 1406.1 | 46.863 | 78.014 | 15.712 |
| 1406.51 | 46.825 | 77.946 | 15.704 |
| 1406.91 | 46.828 | 77.91 | 15.747 |
| 1407.52 | 46.816 | 77.788 | 15.844 |
| 1407.93 | 46.811 | 77.651 | 15.972 |
| 1408.53 | 46.825 | 77.477 | 16.172 |
| 1408.93 | 46.853 | 77.346 | 16.36 |
| 1409.53 | 46.89 | 77.095 | 16.685 |
| 1409.94 | 46.894 | 76.862 | 16.925 |
| 1410.54 | 46.934 | 76.518 | 17.351 |
| 1410.94 | 46.998 | 76.342 | 17.655 |
| 1411.53 | 47.01 | 75.868 | 18.151 |
| 1411.93 | 47.055 | 75.59 | 18.52 |
| 1412.53 | 47.149 | 75.172 | 19.127 |
| 1412.93 | 47.151 | 74.798 | 19.503 |
| 1413.52 | 47.238 | 74.261 | 20.214 |
| 1413.92 | 47.27 | 73.887 | 20.652 |
| 1414.51 | 47.298 | 73.262 | 21.333 |
| 1414.91 | 47.319 | 72.817 | 21.821 |
| 1415.5 | 47.327 | 72.096 | 22.558 |
| 1416.09 | 47.324 | 71.369 | 23.279 |
| 1416.49 | 47.303 | 70.804 | 23.802 |
| 1417.08 | 47.278 | 69.983 | 24.573 |
| 1417.47 | 47.238 | 69.379 | 25.097 |
| 1418.06 | 47.157 | 68.444 | 25.87 |
| 1418.45 | 47.082 | 67.818 | 26.346 |
| 1419.04 | 46.913 | 66.722 | 27.105 |
| 1419.43 | 46.831 | 66.064 | 27.598 |
| 1420.02 | 46.654 | 64.947 | 28.36 |
| 1420.41 | 46.52 | 64.191 | 28.848 |
| 1421.0 | 46.291 | 63.012 | 29.569 |
| 1421.59 | 46.026 | 61.796 | 30.257 |
| 1421.98 | 45.831 | 60.938 | 30.725 |
| 1422.56 | 45.518 | 59.637 | 31.399 |
| 1422.96 | 45.287 | 58.765 | 31.809 |
| 1423.54 | 44.932 | 57.429 | 32.435 |
| 1423.93 | 44.701 | 56.598 | 32.803 |
| 1424.52 | 44.314 | 55.24 | 33.388 |
| 1424.91 | 44.058 | 54.378 | 33.738 |
| 1425.5 | 43.665 | 53.106 | 34.223 |
| 1426.08 | 43.224 | 51.752 | 34.697 |
| 1426.47 | 42.964 | 50.932 | 34.997 |
| 1427.06 | 42.583 | 49.748 | 35.418 |
| 1427.45 | 42.306 | 48.943 | 35.669 |
| 1428.04 | 41.937 | 47.867 | 36.008 |
| 1428.43 | 41.649 | 47.1 | 36.198 |
| 1429.02 | 41.289 | 46.105 | 36.474 |
| 1429.41 | 41.112 | 45.564 | 36.661 |
| 1430.0 | 40.827 | 44.771 | 36.883 |
| 1430.59 | 40.539 | 44.039 | 37.039 |
| 1430.98 | 40.386 | 43.645 | 37.127 |
| 1431.57 | 40.231 | 43.178 | 37.283 |
| 1431.96 | 40.113 | 42.916 | 37.31 |
| 1432.56 | 40.01 | 42.642 | 37.378 |
| 1432.95 | 39.952 | 42.543 | 37.361 |
| 1433.54 | 39.936 | 42.518 | 37.355 |
| 1433.94 | 39.915 | 42.524 | 37.306 |
| 1434.53 | 39.969 | 42.721 | 37.216 |
| 1434.93 | 40.004 | 42.875 | 37.133 |
| 1435.52 | 40.149 | 43.318 | 36.981 |
| 1435.92 | 40.26 | 43.661 | 36.859 |
| 1436.51 | 40.44 | 44.243 | 36.637 |
| 1436.91 | 40.594 | 44.722 | 36.465 |
| 1437.51 | 40.844 | 45.514 | 36.173 |
| 1437.91 | 41.036 | 46.101 | 35.971 |
| 1438.51 | 41.324 | 47.046 | 35.601 |
| 1438.91 | 41.524 | 47.71 | 35.337 |
| 1439.51 | 41.869 | 48.832 | 34.906 |
| 1439.91 | 42.06 | 49.52 | 34.6 |
| 1440.52 | 42.379 | 50.624 | 34.135 |
| 1440.92 | 42.609 | 51.45 | 33.768 |
| 1441.53 | 42.927 | 52.622 | 33.232 |
| 1441.93 | 43.149 | 53.448 | 32.85 |
| 1442.54 | 43.47 | 54.669 | 32.272 |
| 1442.95 | 43.669 | 55.444 | 31.895 |
| 1443.56 | 43.909 | 56.652 | 31.165 |
| 1443.97 | 44.064 | 57.431 | 30.697 |
| 1444.58 | 44.266 | 58.528 | 30.004 |
| 1444.99 | 44.41 | 59.318 | 29.501 |
| 1445.6 | 44.592 | 60.43 | 28.754 |
| 1446.02 | 44.659 | 61.095 | 28.223 |
| 1446.43 | 44.75 | 61.805 | 27.695 |
| 1447.05 | 44.851 | 62.767 | 26.935 |
| 1447.46 | 44.891 | 63.395 | 26.388 |
| 1448.08 | 44.929 | 64.284 | 25.574 |
| 1448.5 | 44.946 | 64.866 | 25.027 |
| 1448.92 | 44.948 | 65.442 | 24.454 |
| 1449.54 | 44.917 | 66.198 | 23.636 |
| 1449.96 | 44.89 | 66.724 | 23.056 |
| 1450.59 | 44.824 | 67.433 | 22.215 |
| 1451.01 | 44.757 | 67.864 | 21.65 |
| 1451.43 | 44.667 | 68.227 | 21.107 |
| 1452.07 | 44.561 | 68.814 | 20.308 |
| 1452.49 | 44.448 | 69.165 | 19.73 |
| 1452.91 | 44.357 | 69.509 | 19.204 |
| 1453.55 | 44.176 | 69.957 | 18.396 |
| 1453.98 | 44.066 | 70.249 | 17.883 |
| 1454.41 | 43.937 | 70.507 | 17.368 |
| 1455.05 | 43.736 | 70.852 | 16.62 |
| 1455.48 | 43.631 | 71.074 | 16.188 |
| 1455.91 | 43.482 | 71.231 | 15.733 |
| 1456.56 | 43.306 | 71.519 | 15.093 |
| 1456.99 | 43.15 | 71.616 | 14.683 |
| 1457.42 | 43.016 | 71.748 | 14.285 |
| 1458.08 | 42.824 | 71.913 | 13.734 |
| 1458.51 | 42.67 | 71.944 | 13.396 |
| 1458.95 | 42.554 | 72.002 | 13.107 |
| 1459.61 | 42.377 | 72.075 | 12.678 |
| 1460.05 | 42.242 | 72.046 | 12.439 |
| 1460.49 | 42.136 | 72.044 | 12.227 |
| 1460.93 | 42.017 | 72.001 | 12.034 |
| 1461.59 | 41.858 | 71.911 | 11.805 |
| 1462.03 | 41.754 | 71.837 | 11.671 |
| 1462.48 | 41.646 | 71.712 | 11.58 |
| 1462.92 | 41.551 | 71.579 | 11.523 |
| 1463.59 | 41.419 | 71.346 | 11.492 |
| 1464.04 | 41.327 | 71.141 | 11.514 |
| 1464.49 | 41.247 | 70.938 | 11.556 |
| 1464.94 | 41.183 | 70.733 | 11.634 |
| 1465.39 | 41.116 | 70.493 | 11.74 |
| 1466.07 | 41.015 | 70.074 | 11.955 |
| 1466.52 | 40.956 | 69.771 | 12.141 |
| 1466.97 | 40.881 | 69.421 | 12.341 |
| 1467.43 | 40.819 | 69.047 | 12.592 |
| 1468.11 | 40.743 | 68.499 | 12.987 |
| 1468.57 | 40.653 | 68.028 | 13.279 |
| 1469.03 | 40.614 | 67.601 | 13.627 |
| 1469.49 | 40.531 | 67.076 | 13.987 |
| 1469.95 | 40.463 | 66.584 | 14.341 |
| 1470.41 | 40.377 | 66.02 | 14.735 |
| 1471.1 | 40.241 | 65.134 | 15.348 |
| 1471.57 | 40.163 | 64.544 | 15.782 |
| 1472.03 | 40.069 | 63.909 | 16.23 |
| 1472.49 | 39.977 | 63.282 | 16.673 |
| 1472.96 | 39.88 | 62.586 | 17.174 |
| 1473.43 | 39.751 | 61.877 | 17.626 |
| 1473.9 | 39.598 | 61.082 | 18.114 |
| 1474.6 | 39.368 | 59.858 | 18.879 |
| 1475.07 | 39.23 | 59.062 | 19.399 |
| 1475.54 | 39.064 | 58.218 | 19.91 |
| 1476.01 | 38.896 | 57.373 | 20.419 |
| 1476.49 | 38.688 | 56.452 | 20.924 |
| 1476.96 | 38.448 | 55.477 | 21.419 |
| 1477.43 | 38.243 | 54.555 | 21.93 |
| 1477.91 | 37.998 | 53.569 | 22.426 |
| 1478.39 | 37.766 | 52.614 | 22.918 |
| 1479.1 | 37.382 | 51.118 | 23.645 |
| 1479.58 | 37.141 | 50.147 | 24.135 |
| 1480.06 | 36.883 | 49.171 | 24.594 |
| 1480.54 | 36.576 | 48.064 | 25.088 |
| 1481.02 | 36.328 | 47.149 | 25.507 |
| 1481.5 | 36.048 | 46.123 | 25.972 |
| 1481.99 | 35.789 | 45.214 | 26.365 |
| 1482.47 | 35.467 | 44.146 | 26.788 |
| 1482.95 | 35.208 | 43.249 | 27.168 |
| 1483.44 | 34.936 | 42.32 | 27.552 |
| 1483.92 | 34.705 | 41.513 | 27.898 |
| 1484.41 | 34.468 | 40.673 | 28.262 |
| 1484.9 | 34.233 | 39.895 | 28.571 |
| 1485.39 | 33.999 | 39.097 | 28.901 |
| 1486.12 | 33.718 | 38.109 | 29.327 |
| 1486.61 | 33.548 | 37.514 | 29.583 |
| 1487.1 | 33.407 | 36.988 | 29.827 |
| 1487.59 | 33.298 | 36.541 | 30.054 |
| 1488.09 | 33.197 | 36.143 | 30.251 |
| 1488.58 | 33.115 | 35.81 | 30.421 |
| 1489.07 | 33.083 | 35.565 | 30.6 |
| 1489.57 | 33.071 | 35.416 | 30.727 |
| 1490.06 | 33.077 | 35.295 | 30.859 |
| 1490.56 | 33.126 | 35.285 | 30.966 |
| 1491.05 | 33.189 | 35.352 | 31.027 |
| 1491.55 | 33.295 | 35.497 | 31.093 |
| 1492.05 | 33.408 | 35.678 | 31.138 |
| 1492.54 | 33.555 | 35.952 | 31.158 |
| 1493.04 | 33.735 | 36.309 | 31.162 |
| 1493.54 | 33.925 | 36.706 | 31.144 |
| 1494.04 | 34.151 | 37.2 | 31.102 |
| 1494.54 | 34.386 | 37.736 | 31.035 |
| 1495.04 | 34.63 | 38.316 | 30.945 |
| 1495.54 | 34.901 | 38.95 | 30.851 |
| 1496.05 | 35.188 | 39.657 | 30.719 |
| 1496.55 | 35.478 | 40.391 | 30.565 |
| 1497.05 | 35.769 | 41.1 | 30.439 |
| 1497.56 | 36.076 | 41.918 | 30.235 |
| 1498.06 | 36.395 | 42.754 | 30.036 |
| 1498.56 | 36.698 | 43.581 | 29.815 |
| 1499.07 | 37.024 | 44.469 | 29.578 |
| 1499.57 | 37.309 | 45.32 | 29.298 |
| 1500.08 | 37.631 | 46.205 | 29.056 |
| 1500.59 | 37.935 | 47.106 | 28.764 |
| 1501.09 | 38.231 | 48.014 | 28.449 |
| 1501.6 | 38.491 | 48.872 | 28.11 |
| 1502.11 | 38.771 | 49.771 | 27.77 |
| 1502.61 | 39.027 | 50.656 | 27.397 |
| 1503.12 | 39.28 | 51.536 | 27.023 |
| 1503.63 | 39.497 | 52.351 | 26.642 |
| 1503.88 | 39.602 | 52.758 | 26.446 |
| 1504.39 | 39.801 | 53.567 | 26.034 |
| 1504.9 | 39.965 | 54.343 | 25.586 |
| 1505.41 | 40.149 | 55.151 | 25.147 |
| 1505.92 | 40.324 | 55.926 | 24.722 |
| 1506.43 | 40.437 | 56.637 | 24.237 |
| 1506.94 | 40.563 | 57.339 | 23.787 |
| 1507.45 | 40.657 | 58.028 | 23.285 |
| 1507.96 | 40.754 | 58.689 | 22.819 |
| 1508.47 | 40.804 | 59.295 | 22.313 |
| 1508.98 | 40.853 | 59.883 | 21.823 |
| 1509.49 | 40.865 | 60.454 | 21.277 |
| 1510.0 | 40.863 | 60.933 | 20.793 |
| 1510.51 | 40.884 | 61.513 | 20.255 |
| 1511.02 | 40.872 | 61.968 | 19.775 |
| 1511.54 | 40.852 | 62.458 | 19.245 |
| 1512.05 | 40.795 | 62.856 | 18.734 |
| 1512.56 | 40.732 | 63.271 | 18.192 |
| 1513.07 | 40.664 | 63.618 | 17.711 |
| 1513.58 | 40.584 | 63.988 | 17.18 |
| 1514.09 | 40.491 | 64.28 | 16.702 |
| 1514.6 | 40.382 | 64.572 | 16.192 |
| 1515.12 | 40.299 | 64.862 | 15.736 |
| 1515.63 | 40.175 | 65.098 | 15.252 |
| 1515.88 | 40.115 | 65.209 | 15.022 |
| 1516.39 | 39.991 | 65.415 | 14.567 |
| 1516.91 | 39.849 | 65.579 | 14.119 |
| 1517.42 | 39.735 | 65.773 | 13.697 |
| 1517.93 | 39.593 | 65.877 | 13.309 |
| 1518.44 | 39.455 | 65.982 | 12.928 |
| 1518.95 | 39.305 | 66.049 | 12.562 |
| 1519.46 | 39.166 | 66.107 | 12.225 |
| 1519.97 | 39.019 | 66.126 | 11.912 |
| 1520.48 | 38.868 | 66.128 | 11.608 |
| 1520.99 | 38.712 | 66.091 | 11.333 |
| 1521.5 | 38.57 | 66.049 | 11.092 |
| 1522.01 | 38.44 | 65.998 | 10.882 |
| 1522.52 | 38.305 | 65.921 | 10.69 |
| 1523.03 | 38.157 | 65.795 | 10.519 |
| 1523.54 | 38.012 | 65.639 | 10.384 |
| 1524.05 | 37.868 | 65.46 | 10.277 |
| 1524.56 | 37.739 | 65.278 | 10.2 |
| 1525.07 | 37.588 | 65.035 | 10.141 |
| 1525.57 | 37.466 | 64.799 | 10.132 |
| 1526.08 | 37.333 | 64.527 | 10.14 |
| 1526.59 | 37.192 | 64.215 | 10.168 |
| 1527.1 | 37.062 | 63.891 | 10.234 |
| 1527.6 | 36.943 | 63.547 | 10.338 |
| 1528.11 | 36.803 | 63.153 | 10.453 |
| 1528.61 | 36.689 | 62.772 | 10.606 |
| 1529.12 | 36.566 | 62.344 | 10.789 |
| 1529.62 | 36.438 | 61.879 | 10.998 |
| 1529.88 | 36.367 | 61.63 | 11.103 |
| 1530.38 | 36.225 | 61.114 | 11.336 |
| 1530.88 | 36.096 | 60.569 | 11.623 |
| 1531.39 | 35.959 | 60.029 | 11.889 |
| 1531.89 | 35.824 | 59.445 | 12.203 |
| 1532.39 | 35.696 | 58.865 | 12.528 |
| 1532.9 | 35.553 | 58.205 | 12.9 |
| 1533.4 | 35.404 | 57.563 | 13.245 |
| 1533.9 | 35.238 | 56.824 | 13.652 |
| 1534.4 | 35.076 | 56.132 | 14.02 |
| 1534.9 | 34.906 | 55.355 | 14.457 |
| 1535.4 | 34.743 | 54.604 | 14.883 |
| 1535.89 | 34.569 | 53.801 | 15.338 |
| 1536.39 | 34.406 | 53.059 | 15.753 |
| 1536.89 | 34.19 | 52.171 | 16.209 |
| 1537.39 | 34.021 | 51.366 | 16.675 |
| 1537.88 | 33.808 | 50.458 | 17.158 |
| 1538.38 | 33.629 | 49.656 | 17.603 |
| 1539.12 | 33.331 | 48.324 | 18.339 |
| 1539.61 | 33.089 | 47.37 | 18.809 |
| 1540.11 | 32.868 | 46.471 | 19.266 |
| 1540.6 | 32.657 | 45.587 | 19.728 |
| 1541.09 | 32.449 | 44.663 | 20.235 |
| 1541.58 | 32.234 | 43.774 | 20.695 |
| 1542.07 | 32.02 | 42.905 | 21.135 |
| 1542.56 | 31.804 | 42.015 | 21.593 |
| 1543.05 | 31.593 | 41.136 | 22.049 |
| 1543.54 | 31.396 | 40.306 | 22.485 |
| 1544.02 | 31.2 | 39.481 | 22.92 |
| 1544.51 | 31.03 | 38.724 | 23.335 |
| 1545.0 | 30.839 | 37.935 | 23.743 |
| 1545.48 | 30.691 | 37.251 | 24.131 |
| 1545.97 | 30.521 | 36.531 | 24.51 |
| 1546.45 | 30.394 | 35.908 | 24.88 |
| 1546.93 | 30.274 | 35.303 | 25.245 |
| 1547.41 | 30.19 | 34.785 | 25.595 |
| 1547.89 | 30.096 | 34.258 | 25.934 |
| 1548.61 | 30.017 | 33.637 | 26.398 |
| 1549.09 | 29.984 | 33.282 | 26.685 |
| 1549.57 | 29.974 | 32.974 | 26.975 |
| 1550.05 | 29.977 | 32.72 | 27.235 |
| 1550.52 | 30.006 | 32.512 | 27.5 |
| 1551.0 | 30.056 | 32.391 | 27.721 |
| 1551.47 | 30.144 | 32.335 | 27.953 |
| 1551.95 | 30.221 | 32.285 | 28.156 |
| 1552.42 | 30.344 | 32.342 | 28.345 |
| 1552.89 | 30.476 | 32.445 | 28.507 |
| 1553.6 | 30.715 | 32.683 | 28.747 |
| 1554.07 | 30.913 | 32.939 | 28.887 |
| 1554.53 | 31.125 | 33.247 | 29.004 |
| 1555.0 | 31.331 | 33.565 | 29.096 |
| 1555.47 | 31.572 | 33.957 | 29.187 |
| 1555.93 | 31.824 | 34.401 | 29.247 |
| 1556.4 | 32.071 | 34.835 | 29.307 |
| 1557.09 | 32.469 | 35.591 | 29.347 |
| 1557.56 | 32.738 | 36.099 | 29.377 |
| 1558.02 | 33.04 | 36.711 | 29.369 |
| 1558.48 | 33.319 | 37.288 | 29.35 |
| 1558.94 | 33.651 | 37.96 | 29.342 |
| 1559.4 | 33.947 | 38.608 | 29.287 |
| 1560.08 | 34.4 | 39.608 | 29.192 |
| 1560.54 | 34.718 | 40.315 | 29.121 |
| 1560.99 | 35.022 | 41.001 | 29.042 |
| 1561.45 | 35.299 | 41.669 | 28.929 |
| 1561.9 | 35.618 | 42.411 | 28.826 |
| 1562.58 | 36.052 | 43.488 | 28.616 |
| 1563.03 | 36.333 | 44.169 | 28.498 |
| 1563.48 | 36.62 | 44.927 | 28.313 |
| 1563.93 | 36.876 | 45.6 | 28.153 |
| 1564.6 | 37.279 | 46.684 | 27.874 |
| 1565.05 | 37.528 | 47.371 | 27.685 |
| 1565.49 | 37.756 | 48.05 | 27.461 |
| 1565.94 | 37.985 | 48.729 | 27.241 |
| 1566.6 | 38.3 | 49.705 | 26.896 |
| 1567.04 | 38.5 | 50.362 | 26.637 |
| 1567.49 | 38.703 | 50.996 | 26.411 |
| 1567.93 | 38.881 | 51.619 | 26.144 |
| 1568.58 | 39.127 | 52.507 | 25.747 |
| 1569.02 | 39.278 | 53.108 | 25.447 |
| 1569.46 | 39.402 | 53.65 | 25.153 |
| 1570.11 | 39.576 | 54.424 | 24.728 |
| 1570.55 | 39.703 | 54.991 | 24.415 |
| 1570.98 | 39.789 | 55.477 | 24.101 |
| 1571.41 | 39.874 | 55.982 | 23.765 |
| 1572.06 | 40.001 | 56.725 | 23.277 |
| 1572.49 | 40.052 | 57.171 | 22.933 |
| 1572.92 | 40.092 | 57.589 | 22.595 |
| 1573.56 | 40.148 | 58.226 | 22.07 |
| 1573.99 | 40.144 | 58.583 | 21.705 |
| 1574.42 | 40.15 | 58.945 | 21.355 |
| 1575.05 | 40.178 | 59.557 | 20.8 |
| 1575.48 | 40.138 | 59.86 | 20.416 |
| 1575.9 | 40.113 | 60.194 | 20.032 |
| 1576.54 | 40.069 | 60.665 | 19.474 |
| 1576.96 | 40.032 | 60.95 | 19.114 |
| 1577.59 | 39.926 | 61.351 | 18.5 |
| 1578.01 | 39.873 | 61.607 | 18.139 |
| 1578.42 | 39.782 | 61.823 | 17.74 |
| 1579.05 | 39.655 | 62.149 | 17.162 |
| 1579.47 | 39.594 | 62.375 | 16.814 |
| 1580.09 | 39.439 | 62.636 | 16.243 |
| 1580.5 | 39.333 | 62.795 | 15.871 |
| 1580.92 | 39.203 | 62.927 | 15.479 |
| 1581.53 | 39.051 | 63.144 | 14.959 |
| 1581.95 | 38.939 | 63.263 | 14.614 |
| 1582.56 | 38.751 | 63.444 | 14.058 |
| 1582.97 | 38.618 | 63.519 | 13.716 |
| 1583.58 | 38.404 | 63.623 | 13.185 |
| 1583.99 | 38.25 | 63.671 | 12.828 |
| 1584.6 | 38.052 | 63.739 | 12.365 |
| 1585.01 | 37.898 | 63.76 | 12.035 |
| 1585.41 | 37.743 | 63.744 | 11.742 |
| 1586.02 | 37.54 | 63.777 | 11.303 |
| 1586.42 | 37.364 | 63.734 | 10.993 |
| 1587.03 | 37.136 | 63.702 | 10.57 |
| 1587.43 | 36.984 | 63.656 | 10.312 |
| 1588.03 | 36.756 | 63.569 | 9.943 |
| 1588.43 | 36.612 | 63.504 | 9.721 |
| 1589.03 | 36.343 | 63.318 | 9.368 |
| 1589.43 | 36.194 | 63.228 | 9.161 |
| 1590.03 | 35.949 | 63.025 | 8.873 |
| 1590.43 | 35.787 | 62.883 | 8.691 |
| 1591.02 | 35.531 | 62.607 | 8.454 |
| 1591.42 | 35.38 | 62.46 | 8.3 |
| 1592.01 | 35.131 | 62.154 | 8.108 |
| 1592.41 | 34.998 | 62 | 7.996 |
| 1593.0 | 34.746 | 61.635 | 7.856 |
| 1593.59 | 34.499 | 61.262 | 7.736 |
| 1593.98 | 34.372 | 61.055 | 7.689 |
| 1594.57 | 34.133 | 60.639 | 7.627 |
| 1594.97 | 33.973 | 60.337 | 7.61 |
| 1595.56 | 33.745 | 59.885 | 7.605 |
| 1595.95 | 33.586 | 59.557 | 7.616 |
| 1596.53 | 33.344 | 59.032 | 7.656 |
| 1596.93 | 33.199 | 58.692 | 7.707 |
| 1597.51 | 32.959 | 58.116 | 7.802 |
| 1598.1 | 32.719 | 57.518 | 7.921 |
| 1598.49 | 32.572 | 57.123 | 8.021 |
| 1599.07 | 32.327 | 56.469 | 8.186 |
| 1599.46 | 32.182 | 56.047 | 8.317 |
| 1600.04 | 31.954 | 55.358 | 8.549 |
| 1600.43 | 31.787 | 54.867 | 8.708 |
| 1601.02 | 31.532 | 54.107 | 8.956 |
| 1601.6 | 31.272 | 53.301 | 9.244 |
| 1601.99 | 31.106 | 52.763 | 9.449 |
| 1602.57 | 30.881 | 51.998 | 9.764 |
| 1602.96 | 30.694 | 51.392 | 9.997 |
| 1603.54 | 30.422 | 50.501 | 10.344 |
| 1603.93 | 30.296 | 49.984 | 10.608 |
| 1604.51 | 30.014 | 49.028 | 11.001 |
| 1605.09 | 29.725 | 48.061 | 11.389 |
| 1605.48 | 29.538 | 47.405 | 11.67 |
| 1606.06 | 29.267 | 46.447 | 12.087 |
| 1606.45 | 29.071 | 45.776 | 12.367 |
| 1607.03 | 28.779 | 44.74 | 12.817 |
| 1607.42 | 28.603 | 44.087 | 13.12 |
| 1608.0 | 28.316 | 43.06 | 13.573 |
| 1608.58 | 28.032 | 42.024 | 14.04 |
| 1608.97 | 27.818 | 41.301 | 14.334 |
| 1609.56 | 27.573 | 40.335 | 14.81 |
| 1609.95 | 27.383 | 39.624 | 15.142 |
| 1610.53 | 27.082 | 38.545 | 15.619 |
| 1610.92 | 26.92 | 37.89 | 15.95 |
| 1611.51 | 26.636 | 36.847 | 16.425 |
| 1612.09 | 26.378 | 35.851 | 16.905 |
| 1612.48 | 26.205 | 35.183 | 17.226 |
| 1613.07 | 25.968 | 34.229 | 17.707 |
| 1613.46 | 25.837 | 33.664 | 18.011 |
| 1614.05 | 25.606 | 32.729 | 18.483 |
| 1614.44 | 25.485 | 32.174 | 18.795 |
| 1615.03 | 25.3 | 31.367 | 19.234 |
| 1615.42 | 25.182 | 30.814 | 19.549 |
| 1616.01 | 25.036 | 30.085 | 19.988 |
| 1616.41 | 24.927 | 29.587 | 20.268 |
| 1617.0 | 24.84 | 28.98 | 20.699 |
| 1617.6 | 24.743 | 28.374 | 21.113 |
| 1617.99 | 24.712 | 28.053 | 21.371 |
| 1618.59 | 24.671 | 27.567 | 21.776 |
| 1618.98 | 24.674 | 27.322 | 22.027 |
| 1619.58 | 24.699 | 26.977 | 22.421 |
| 1619.98 | 24.727 | 26.803 | 22.65 |
| 1620.58 | 24.805 | 26.611 | 23 |
| 1620.98 | 24.881 | 26.542 | 23.22 |
| 1621.58 | 25.001 | 26.472 | 23.531 |
| 1621.98 | 25.108 | 26.475 | 23.741 |
| 1622.59 | 25.296 | 26.566 | 24.025 |
| 1622.99 | 25.417 | 26.651 | 24.182 |
| 1623.6 | 25.665 | 26.878 | 24.452 |
| 1624.0 | 25.836 | 27.049 | 24.623 |
| 1624.41 | 26.021 | 27.271 | 24.772 |
| 1625.02 | 26.336 | 27.683 | 24.988 |
| 1625.42 | 26.535 | 27.967 | 25.103 |
| 1626.04 | 26.888 | 28.486 | 25.289 |
| 1626.45 | 27.156 | 28.903 | 25.409 |
| 1627.06 | 27.527 | 29.501 | 25.552 |
| 1627.47 | 27.81 | 29.981 | 25.639 |
| 1628.09 | 28.217 | 30.682 | 25.751 |
| 1628.5 | 28.499 | 31.185 | 25.813 |
| 1628.92 | 28.771 | 31.685 | 25.858 |
| 1629.54 | 29.221 | 32.51 | 25.933 |
| 1629.95 | 29.523 | 33.096 | 25.95 |
| 1630.58 | 29.991 | 33.991 | 25.991 |
| 1631.0 | 30.298 | 34.607 | 25.989 |
| 1631.41 | 30.601 | 35.214 | 25.988 |
| 1632.04 | 31.05 | 36.135 | 25.965 |
| 1632.46 | 31.38 | 36.81 | 25.95 |
| 1633.1 | 31.824 | 37.771 | 25.877 |
| 1633.52 | 32.121 | 38.413 | 25.828 |
| 1633.94 | 32.408 | 39.052 | 25.765 |
| 1634.58 | 32.86 | 40.051 | 25.67 |
| 1635.01 | 33.146 | 40.712 | 25.58 |
| 1635.43 | 33.399 | 41.319 | 25.479 |
| 1636.07 | 33.837 | 42.342 | 25.332 |
| 1636.5 | 34.095 | 42.974 | 25.215 |
| 1636.93 | 34.379 | 43.657 | 25.101 |
| 1637.58 | 34.72 | 44.562 | 24.879 |
| 1638.01 | 34.954 | 45.169 | 24.739 |
| 1638.44 | 35.187 | 45.813 | 24.562 |
| 1639.09 | 35.509 | 46.694 | 24.324 |
| 1639.53 | 35.713 | 47.278 | 24.148 |
| 1639.97 | 35.913 | 47.869 | 23.958 |
| 1640.4 | 36.095 | 48.425 | 23.764 |
| 1641.06 | 36.356 | 49.266 | 23.446 |
| 1641.5 | 36.522 | 49.782 | 23.261 |
| 1641.94 | 36.669 | 50.345 | 22.992 |
| 1642.6 | 36.873 | 51.099 | 22.648 |
| 1643.05 | 36.988 | 51.58 | 22.397 |
| 1643.49 | 37.113 | 52.069 | 22.158 |
| 1643.93 | 37.205 | 52.533 | 21.877 |
| 1644.6 | 37.357 | 53.236 | 21.479 |
| 1645.05 | 37.425 | 53.665 | 21.186 |
| 1645.5 | 37.485 | 54.076 | 20.894 |
| 1645.95 | 37.534 | 54.48 | 20.588 |
| 1646.4 | 37.603 | 54.918 | 20.288 |
| 1647.07 | 37.626 | 55.439 | 19.812 |
| 1647.52 | 37.627 | 55.775 | 19.478 |
| 1647.98 | 37.646 | 56.128 | 19.163 |
| 1648.43 | 37.646 | 56.463 | 18.829 |
| 1649.11 | 37.618 | 56.916 | 18.321 |
| 1649.57 | 37.586 | 57.197 | 17.974 |
| 1650.03 | 37.559 | 57.476 | 17.642 |